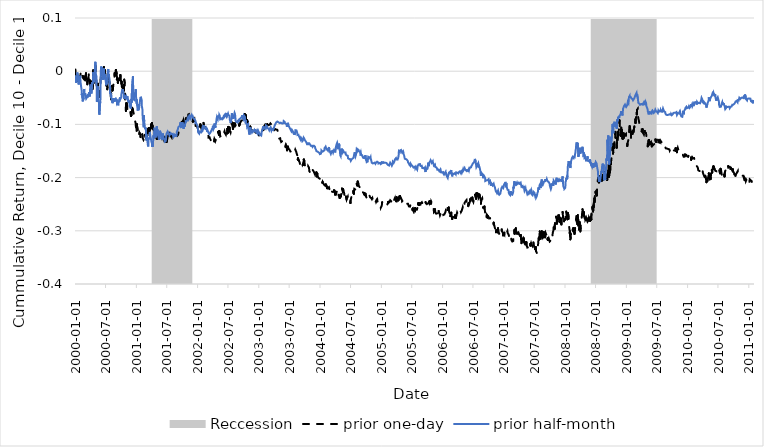
| Category | prior one-day | prior half-month |
|---|---|---|
| 2000-01-03 | 0.003 | -0.008 |
| 2000-01-04 | -0.003 | -0.012 |
| 2000-01-05 | -0.006 | -0.019 |
| 2000-01-06 | -0.02 | -0.017 |
| 2000-01-07 | -0.022 | -0.022 |
| 2000-01-10 | -0.019 | -0.021 |
| 2000-01-11 | -0.021 | -0.024 |
| 2000-01-12 | -0.018 | -0.015 |
| 2000-01-13 | -0.015 | -0.012 |
| 2000-01-14 | -0.017 | -0.002 |
| 2000-01-18 | -0.018 | -0.008 |
| 2000-01-19 | -0.016 | -0.01 |
| 2000-01-20 | -0.014 | -0.016 |
| 2000-01-21 | -0.011 | -0.025 |
| 2000-01-24 | -0.015 | -0.023 |
| 2000-01-25 | -0.012 | -0.019 |
| 2000-01-26 | -0.011 | -0.014 |
| 2000-01-27 | -0.01 | -0.015 |
| 2000-01-28 | -0.016 | -0.018 |
| 2000-01-31 | -0.011 | -0.009 |
| 2000-02-01 | -0.01 | -0.013 |
| 2000-02-02 | -0.008 | -0.018 |
| 2000-02-03 | -0.006 | -0.022 |
| 2000-02-04 | -0.001 | -0.024 |
| 2000-02-07 | -0.002 | -0.031 |
| 2000-02-08 | 0 | -0.033 |
| 2000-02-09 | -0.003 | -0.035 |
| 2000-02-10 | -0.002 | -0.045 |
| 2000-02-11 | -0.003 | -0.041 |
| 2000-02-14 | -0.006 | -0.051 |
| 2000-02-15 | -0.008 | -0.054 |
| 2000-02-16 | -0.012 | -0.057 |
| 2000-02-17 | -0.013 | -0.052 |
| 2000-02-18 | -0.014 | -0.054 |
| 2000-02-22 | -0.015 | -0.05 |
| 2000-02-23 | -0.01 | -0.038 |
| 2000-02-24 | -0.013 | -0.033 |
| 2000-02-25 | -0.014 | -0.039 |
| 2000-02-28 | -0.012 | -0.045 |
| 2000-02-29 | -0.015 | -0.044 |
| 2000-03-01 | -0.013 | -0.042 |
| 2000-03-02 | -0.016 | -0.043 |
| 2000-03-03 | -0.01 | -0.043 |
| 2000-03-06 | -0.004 | -0.05 |
| 2000-03-07 | -0.015 | -0.049 |
| 2000-03-08 | -0.015 | -0.048 |
| 2000-03-09 | -0.013 | -0.047 |
| 2000-03-10 | -0.014 | -0.049 |
| 2000-03-13 | -0.017 | -0.048 |
| 2000-03-14 | -0.025 | -0.047 |
| 2000-03-15 | -0.025 | -0.049 |
| 2000-03-16 | -0.026 | -0.044 |
| 2000-03-17 | -0.014 | -0.047 |
| 2000-03-20 | -0.017 | -0.048 |
| 2000-03-21 | -0.013 | -0.049 |
| 2000-03-22 | -0.008 | -0.049 |
| 2000-03-23 | -0.006 | -0.046 |
| 2000-03-24 | -0.004 | -0.039 |
| 2000-03-27 | -0.003 | -0.039 |
| 2000-03-28 | -0.006 | -0.042 |
| 2000-03-29 | -0.014 | -0.047 |
| 2000-03-30 | -0.026 | -0.035 |
| 2000-03-31 | -0.027 | -0.032 |
| 2000-04-03 | -0.021 | -0.025 |
| 2000-04-04 | -0.019 | -0.029 |
| 2000-04-05 | -0.02 | -0.038 |
| 2000-04-06 | -0.021 | -0.04 |
| 2000-04-07 | -0.027 | -0.042 |
| 2000-04-10 | -0.022 | -0.035 |
| 2000-04-11 | -0.022 | -0.027 |
| 2000-04-12 | -0.024 | -0.02 |
| 2000-04-13 | -0.026 | -0.024 |
| 2000-04-14 | -0.034 | -0.024 |
| 2000-04-17 | -0.018 | -0.02 |
| 2000-04-18 | 0.002 | -0.002 |
| 2000-04-19 | -0.003 | -0.006 |
| 2000-04-20 | -0.011 | -0.008 |
| 2000-04-24 | -0.021 | -0.021 |
| 2000-04-25 | -0.006 | -0.008 |
| 2000-04-26 | -0.011 | -0.008 |
| 2000-04-27 | -0.002 | -0.001 |
| 2000-04-28 | 0.005 | 0.004 |
| 2000-05-01 | 0.011 | 0.018 |
| 2000-05-02 | -0.003 | -0.008 |
| 2000-05-03 | -0.008 | -0.016 |
| 2000-05-04 | -0.012 | -0.011 |
| 2000-05-05 | -0.014 | -0.005 |
| 2000-05-08 | -0.023 | -0.022 |
| 2000-05-09 | -0.03 | -0.035 |
| 2000-05-10 | -0.042 | -0.058 |
| 2000-05-11 | -0.04 | -0.05 |
| 2000-05-12 | -0.034 | -0.043 |
| 2000-05-15 | -0.026 | -0.04 |
| 2000-05-16 | -0.023 | -0.029 |
| 2000-05-17 | -0.028 | -0.031 |
| 2000-05-18 | -0.029 | -0.04 |
| 2000-05-19 | -0.038 | -0.053 |
| 2000-05-22 | -0.042 | -0.059 |
| 2000-05-23 | -0.048 | -0.078 |
| 2000-05-24 | -0.046 | -0.078 |
| 2000-05-25 | -0.039 | -0.082 |
| 2000-05-26 | -0.041 | -0.081 |
| 2000-05-30 | -0.028 | -0.057 |
| 2000-05-31 | -0.023 | -0.053 |
| 2000-06-01 | -0.017 | -0.037 |
| 2000-06-02 | -0.008 | 0 |
| 2000-06-05 | -0.008 | 0.009 |
| 2000-06-06 | -0.008 | 0.001 |
| 2000-06-07 | -0.004 | 0.005 |
| 2000-06-08 | -0.003 | 0.003 |
| 2000-06-09 | -0.007 | 0.008 |
| 2000-06-12 | -0.005 | -0.008 |
| 2000-06-13 | -0.001 | -0.007 |
| 2000-06-14 | -0.002 | -0.016 |
| 2000-06-15 | -0.007 | -0.016 |
| 2000-06-16 | -0.012 | -0.016 |
| 2000-06-19 | 0.002 | 0.002 |
| 2000-06-20 | 0.005 | 0.005 |
| 2000-06-21 | 0.008 | 0.007 |
| 2000-06-22 | 0.002 | -0.001 |
| 2000-06-23 | -0.004 | -0.012 |
| 2000-06-26 | 0.002 | -0.009 |
| 2000-06-27 | -0.006 | -0.015 |
| 2000-06-28 | -0.003 | -0.006 |
| 2000-06-29 | -0.009 | -0.013 |
| 2000-06-30 | -0.007 | -0.012 |
| 2000-07-03 | -0.01 | -0.011 |
| 2000-07-05 | -0.027 | -0.026 |
| 2000-07-06 | -0.024 | -0.023 |
| 2000-07-07 | -0.017 | -0.012 |
| 2000-07-10 | -0.027 | -0.013 |
| 2000-07-11 | -0.034 | -0.023 |
| 2000-07-12 | -0.03 | -0.017 |
| 2000-07-13 | -0.021 | -0.008 |
| 2000-07-14 | -0.014 | 0.001 |
| 2000-07-17 | -0.011 | 0.004 |
| 2000-07-18 | -0.018 | -0.002 |
| 2000-07-19 | -0.02 | -0.007 |
| 2000-07-20 | -0.012 | -0.005 |
| 2000-07-21 | -0.016 | -0.008 |
| 2000-07-24 | -0.02 | -0.015 |
| 2000-07-25 | -0.019 | -0.015 |
| 2000-07-26 | -0.023 | -0.023 |
| 2000-07-27 | -0.028 | -0.033 |
| 2000-07-28 | -0.036 | -0.043 |
| 2000-07-31 | -0.039 | -0.041 |
| 2000-08-01 | -0.047 | -0.045 |
| 2000-08-02 | -0.053 | -0.049 |
| 2000-08-03 | -0.042 | -0.045 |
| 2000-08-04 | -0.038 | -0.049 |
| 2000-08-07 | -0.032 | -0.05 |
| 2000-08-08 | -0.027 | -0.05 |
| 2000-08-09 | -0.03 | -0.058 |
| 2000-08-10 | -0.034 | -0.059 |
| 2000-08-11 | -0.036 | -0.06 |
| 2000-08-14 | -0.032 | -0.056 |
| 2000-08-15 | -0.031 | -0.051 |
| 2000-08-16 | -0.032 | -0.053 |
| 2000-08-17 | -0.024 | -0.051 |
| 2000-08-18 | -0.021 | -0.053 |
| 2000-08-21 | -0.019 | -0.056 |
| 2000-08-22 | -0.016 | -0.056 |
| 2000-08-23 | -0.008 | -0.058 |
| 2000-08-24 | -0.004 | -0.056 |
| 2000-08-25 | -0.008 | -0.054 |
| 2000-08-28 | -0.005 | -0.053 |
| 2000-08-29 | -0.005 | -0.053 |
| 2000-08-30 | -0.006 | -0.052 |
| 2000-08-31 | 0.002 | -0.051 |
| 2000-09-01 | 0.004 | -0.052 |
| 2000-09-05 | -0.004 | -0.053 |
| 2000-09-06 | -0.016 | -0.055 |
| 2000-09-07 | -0.011 | -0.06 |
| 2000-09-08 | -0.015 | -0.06 |
| 2000-09-11 | -0.018 | -0.057 |
| 2000-09-12 | -0.022 | -0.059 |
| 2000-09-13 | -0.022 | -0.061 |
| 2000-09-14 | -0.02 | -0.064 |
| 2000-09-15 | -0.017 | -0.061 |
| 2000-09-18 | -0.017 | -0.058 |
| 2000-09-19 | -0.017 | -0.056 |
| 2000-09-20 | -0.014 | -0.058 |
| 2000-09-21 | -0.016 | -0.057 |
| 2000-09-22 | -0.016 | -0.053 |
| 2000-09-25 | -0.013 | -0.049 |
| 2000-09-26 | -0.01 | -0.053 |
| 2000-09-27 | -0.007 | -0.052 |
| 2000-09-28 | -0.013 | -0.051 |
| 2000-09-29 | -0.014 | -0.053 |
| 2000-10-02 | -0.02 | -0.049 |
| 2000-10-03 | -0.024 | -0.043 |
| 2000-10-04 | -0.02 | -0.043 |
| 2000-10-05 | -0.022 | -0.04 |
| 2000-10-06 | -0.029 | -0.04 |
| 2000-10-09 | -0.03 | -0.041 |
| 2000-10-10 | -0.035 | -0.035 |
| 2000-10-11 | -0.04 | -0.037 |
| 2000-10-12 | -0.04 | -0.033 |
| 2000-10-13 | -0.028 | -0.038 |
| 2000-10-16 | -0.026 | -0.041 |
| 2000-10-17 | -0.028 | -0.044 |
| 2000-10-18 | -0.037 | -0.048 |
| 2000-10-19 | -0.027 | -0.052 |
| 2000-10-20 | -0.016 | -0.045 |
| 2000-10-23 | -0.022 | -0.045 |
| 2000-10-24 | -0.031 | -0.046 |
| 2000-10-25 | -0.052 | -0.048 |
| 2000-10-26 | -0.054 | -0.048 |
| 2000-10-27 | -0.06 | -0.049 |
| 2000-10-30 | -0.075 | -0.053 |
| 2000-10-31 | -0.065 | -0.05 |
| 2000-11-01 | -0.061 | -0.049 |
| 2000-11-02 | -0.063 | -0.048 |
| 2000-11-03 | -0.06 | -0.049 |
| 2000-11-06 | -0.063 | -0.051 |
| 2000-11-07 | -0.065 | -0.051 |
| 2000-11-08 | -0.072 | -0.047 |
| 2000-11-09 | -0.071 | -0.049 |
| 2000-11-10 | -0.075 | -0.051 |
| 2000-11-13 | -0.075 | -0.054 |
| 2000-11-14 | -0.072 | -0.057 |
| 2000-11-15 | -0.072 | -0.054 |
| 2000-11-16 | -0.072 | -0.058 |
| 2000-11-17 | -0.073 | -0.056 |
| 2000-11-20 | -0.071 | -0.06 |
| 2000-11-21 | -0.071 | -0.062 |
| 2000-11-22 | -0.071 | -0.066 |
| 2000-11-24 | -0.073 | -0.061 |
| 2000-11-27 | -0.08 | -0.061 |
| 2000-11-28 | -0.082 | -0.07 |
| 2000-11-29 | -0.084 | -0.066 |
| 2000-11-30 | -0.081 | -0.062 |
| 2000-12-01 | -0.084 | -0.052 |
| 2000-12-04 | -0.077 | -0.059 |
| 2000-12-05 | -0.076 | -0.034 |
| 2000-12-06 | -0.071 | -0.035 |
| 2000-12-07 | -0.069 | -0.036 |
| 2000-12-08 | -0.068 | -0.018 |
| 2000-12-11 | -0.072 | -0.01 |
| 2000-12-12 | -0.071 | -0.024 |
| 2000-12-13 | -0.076 | -0.043 |
| 2000-12-14 | -0.077 | -0.053 |
| 2000-12-15 | -0.079 | -0.054 |
| 2000-12-18 | -0.087 | -0.054 |
| 2000-12-19 | -0.09 | -0.051 |
| 2000-12-20 | -0.09 | -0.054 |
| 2000-12-21 | -0.089 | -0.054 |
| 2000-12-22 | -0.091 | -0.042 |
| 2000-12-26 | -0.096 | -0.043 |
| 2000-12-27 | -0.098 | -0.039 |
| 2000-12-28 | -0.103 | -0.034 |
| 2000-12-29 | -0.104 | -0.046 |
| 2001-01-02 | -0.112 | -0.061 |
| 2001-01-03 | -0.104 | -0.053 |
| 2001-01-04 | -0.099 | -0.06 |
| 2001-01-05 | -0.103 | -0.065 |
| 2001-01-08 | -0.104 | -0.067 |
| 2001-01-09 | -0.109 | -0.074 |
| 2001-01-10 | -0.113 | -0.07 |
| 2001-01-11 | -0.111 | -0.065 |
| 2001-01-12 | -0.116 | -0.066 |
| 2001-01-16 | -0.114 | -0.064 |
| 2001-01-17 | -0.115 | -0.069 |
| 2001-01-18 | -0.118 | -0.066 |
| 2001-01-19 | -0.116 | -0.064 |
| 2001-01-22 | -0.117 | -0.056 |
| 2001-01-23 | -0.118 | -0.053 |
| 2001-01-24 | -0.124 | -0.054 |
| 2001-01-25 | -0.122 | -0.051 |
| 2001-01-26 | -0.123 | -0.048 |
| 2001-01-29 | -0.126 | -0.05 |
| 2001-01-30 | -0.126 | -0.051 |
| 2001-01-31 | -0.127 | -0.05 |
| 2001-02-01 | -0.124 | -0.054 |
| 2001-02-02 | -0.121 | -0.065 |
| 2001-02-05 | -0.119 | -0.071 |
| 2001-02-06 | -0.124 | -0.074 |
| 2001-02-07 | -0.125 | -0.086 |
| 2001-02-08 | -0.126 | -0.09 |
| 2001-02-09 | -0.125 | -0.092 |
| 2001-02-12 | -0.129 | -0.097 |
| 2001-02-13 | -0.129 | -0.106 |
| 2001-02-14 | -0.129 | -0.091 |
| 2001-02-15 | -0.131 | -0.083 |
| 2001-02-16 | -0.126 | -0.094 |
| 2001-02-20 | -0.123 | -0.104 |
| 2001-02-21 | -0.12 | -0.105 |
| 2001-02-22 | -0.119 | -0.109 |
| 2001-02-23 | -0.121 | -0.106 |
| 2001-02-26 | -0.125 | -0.109 |
| 2001-02-27 | -0.119 | -0.121 |
| 2001-02-28 | -0.116 | -0.125 |
| 2001-03-01 | -0.118 | -0.118 |
| 2001-03-02 | -0.114 | -0.13 |
| 2001-03-05 | -0.115 | -0.129 |
| 2001-03-06 | -0.121 | -0.124 |
| 2001-03-07 | -0.12 | -0.125 |
| 2001-03-08 | -0.117 | -0.131 |
| 2001-03-09 | -0.11 | -0.138 |
| 2001-03-12 | -0.108 | -0.141 |
| 2001-03-13 | -0.115 | -0.129 |
| 2001-03-14 | -0.111 | -0.127 |
| 2001-03-15 | -0.11 | -0.127 |
| 2001-03-16 | -0.107 | -0.128 |
| 2001-03-19 | -0.109 | -0.126 |
| 2001-03-20 | -0.109 | -0.127 |
| 2001-03-21 | -0.11 | -0.123 |
| 2001-03-22 | -0.112 | -0.114 |
| 2001-03-23 | -0.11 | -0.117 |
| 2001-03-26 | -0.109 | -0.124 |
| 2001-03-27 | -0.109 | -0.126 |
| 2001-03-28 | -0.104 | -0.125 |
| 2001-03-29 | -0.1 | -0.128 |
| 2001-03-30 | -0.105 | -0.131 |
| 2001-04-02 | -0.103 | -0.133 |
| 2001-04-03 | -0.097 | -0.136 |
| 2001-04-04 | -0.1 | -0.142 |
| 2001-04-05 | -0.107 | -0.134 |
| 2001-04-06 | -0.102 | -0.137 |
| 2001-04-09 | -0.103 | -0.142 |
| 2001-04-10 | -0.108 | -0.135 |
| 2001-04-11 | -0.11 | -0.125 |
| 2001-04-12 | -0.11 | -0.121 |
| 2001-04-16 | -0.11 | -0.126 |
| 2001-04-17 | -0.112 | -0.127 |
| 2001-04-18 | -0.112 | -0.112 |
| 2001-04-19 | -0.113 | -0.106 |
| 2001-04-20 | -0.114 | -0.108 |
| 2001-04-23 | -0.116 | -0.117 |
| 2001-04-24 | -0.115 | -0.121 |
| 2001-04-25 | -0.116 | -0.124 |
| 2001-04-26 | -0.117 | -0.126 |
| 2001-04-27 | -0.118 | -0.123 |
| 2001-04-30 | -0.122 | -0.124 |
| 2001-05-01 | -0.125 | -0.12 |
| 2001-05-02 | -0.127 | -0.104 |
| 2001-05-03 | -0.121 | -0.109 |
| 2001-05-04 | -0.127 | -0.112 |
| 2001-05-07 | -0.124 | -0.112 |
| 2001-05-08 | -0.125 | -0.11 |
| 2001-05-09 | -0.124 | -0.119 |
| 2001-05-10 | -0.121 | -0.119 |
| 2001-05-11 | -0.12 | -0.118 |
| 2001-05-14 | -0.119 | -0.126 |
| 2001-05-15 | -0.12 | -0.129 |
| 2001-05-16 | -0.124 | -0.122 |
| 2001-05-17 | -0.124 | -0.118 |
| 2001-05-18 | -0.126 | -0.123 |
| 2001-05-21 | -0.128 | -0.112 |
| 2001-05-22 | -0.126 | -0.111 |
| 2001-05-23 | -0.126 | -0.113 |
| 2001-05-24 | -0.125 | -0.112 |
| 2001-05-25 | -0.122 | -0.113 |
| 2001-05-29 | -0.122 | -0.12 |
| 2001-05-30 | -0.122 | -0.128 |
| 2001-05-31 | -0.123 | -0.127 |
| 2001-06-01 | -0.125 | -0.124 |
| 2001-06-04 | -0.127 | -0.129 |
| 2001-06-05 | -0.129 | -0.127 |
| 2001-06-06 | -0.127 | -0.122 |
| 2001-06-07 | -0.125 | -0.117 |
| 2001-06-08 | -0.126 | -0.12 |
| 2001-06-11 | -0.124 | -0.123 |
| 2001-06-12 | -0.125 | -0.126 |
| 2001-06-13 | -0.127 | -0.124 |
| 2001-06-14 | -0.126 | -0.126 |
| 2001-06-15 | -0.126 | -0.127 |
| 2001-06-18 | -0.122 | -0.13 |
| 2001-06-19 | -0.12 | -0.132 |
| 2001-06-20 | -0.122 | -0.132 |
| 2001-06-21 | -0.119 | -0.134 |
| 2001-06-22 | -0.117 | -0.134 |
| 2001-06-25 | -0.118 | -0.131 |
| 2001-06-26 | -0.121 | -0.13 |
| 2001-06-27 | -0.124 | -0.124 |
| 2001-06-28 | -0.126 | -0.122 |
| 2001-06-29 | -0.133 | -0.118 |
| 2001-07-02 | -0.13 | -0.116 |
| 2001-07-03 | -0.13 | -0.115 |
| 2001-07-05 | -0.126 | -0.115 |
| 2001-07-06 | -0.119 | -0.113 |
| 2001-07-09 | -0.12 | -0.115 |
| 2001-07-10 | -0.117 | -0.114 |
| 2001-07-11 | -0.117 | -0.116 |
| 2001-07-12 | -0.121 | -0.118 |
| 2001-07-13 | -0.12 | -0.118 |
| 2001-07-16 | -0.116 | -0.118 |
| 2001-07-17 | -0.119 | -0.121 |
| 2001-07-18 | -0.117 | -0.121 |
| 2001-07-19 | -0.119 | -0.121 |
| 2001-07-20 | -0.122 | -0.119 |
| 2001-07-23 | -0.121 | -0.117 |
| 2001-07-24 | -0.118 | -0.116 |
| 2001-07-25 | -0.118 | -0.116 |
| 2001-07-26 | -0.122 | -0.117 |
| 2001-07-27 | -0.124 | -0.117 |
| 2001-07-30 | -0.124 | -0.118 |
| 2001-07-31 | -0.122 | -0.12 |
| 2001-08-01 | -0.122 | -0.119 |
| 2001-08-02 | -0.119 | -0.119 |
| 2001-08-03 | -0.12 | -0.118 |
| 2001-08-06 | -0.118 | -0.118 |
| 2001-08-07 | -0.117 | -0.121 |
| 2001-08-08 | -0.114 | -0.121 |
| 2001-08-09 | -0.113 | -0.122 |
| 2001-08-10 | -0.113 | -0.124 |
| 2001-08-13 | -0.115 | -0.123 |
| 2001-08-14 | -0.117 | -0.122 |
| 2001-08-15 | -0.117 | -0.121 |
| 2001-08-16 | -0.118 | -0.121 |
| 2001-08-17 | -0.117 | -0.119 |
| 2001-08-20 | -0.116 | -0.119 |
| 2001-08-21 | -0.116 | -0.12 |
| 2001-08-22 | -0.117 | -0.12 |
| 2001-08-23 | -0.118 | -0.12 |
| 2001-08-24 | -0.121 | -0.124 |
| 2001-08-27 | -0.123 | -0.123 |
| 2001-08-28 | -0.122 | -0.12 |
| 2001-08-29 | -0.123 | -0.117 |
| 2001-08-30 | -0.122 | -0.114 |
| 2001-08-31 | -0.121 | -0.113 |
| 2001-09-04 | -0.121 | -0.11 |
| 2001-09-05 | -0.12 | -0.111 |
| 2001-09-06 | -0.121 | -0.108 |
| 2001-09-07 | -0.119 | -0.106 |
| 2001-09-10 | -0.115 | -0.107 |
| 2001-09-17 | -0.109 | -0.102 |
| 2001-09-18 | -0.109 | -0.1 |
| 2001-09-19 | -0.107 | -0.101 |
| 2001-09-20 | -0.102 | -0.099 |
| 2001-09-21 | -0.1 | -0.096 |
| 2001-09-24 | -0.103 | -0.105 |
| 2001-09-25 | -0.102 | -0.106 |
| 2001-09-26 | -0.097 | -0.104 |
| 2001-09-27 | -0.096 | -0.105 |
| 2001-09-28 | -0.1 | -0.104 |
| 2001-10-01 | -0.095 | -0.104 |
| 2001-10-02 | -0.096 | -0.104 |
| 2001-10-03 | -0.096 | -0.096 |
| 2001-10-04 | -0.098 | -0.103 |
| 2001-10-05 | -0.094 | -0.102 |
| 2001-10-08 | -0.092 | -0.102 |
| 2001-10-09 | -0.094 | -0.108 |
| 2001-10-10 | -0.095 | -0.109 |
| 2001-10-11 | -0.098 | -0.104 |
| 2001-10-12 | -0.096 | -0.104 |
| 2001-10-15 | -0.096 | -0.1 |
| 2001-10-16 | -0.097 | -0.1 |
| 2001-10-17 | -0.097 | -0.104 |
| 2001-10-18 | -0.095 | -0.1 |
| 2001-10-19 | -0.095 | -0.098 |
| 2001-10-22 | -0.092 | -0.094 |
| 2001-10-23 | -0.089 | -0.092 |
| 2001-10-24 | -0.092 | -0.092 |
| 2001-10-25 | -0.092 | -0.093 |
| 2001-10-26 | -0.093 | -0.094 |
| 2001-10-29 | -0.09 | -0.096 |
| 2001-10-30 | -0.089 | -0.094 |
| 2001-10-31 | -0.089 | -0.092 |
| 2001-11-01 | -0.088 | -0.092 |
| 2001-11-02 | -0.086 | -0.089 |
| 2001-11-05 | -0.086 | -0.086 |
| 2001-11-06 | -0.085 | -0.085 |
| 2001-11-07 | -0.081 | -0.086 |
| 2001-11-08 | -0.086 | -0.091 |
| 2001-11-09 | -0.085 | -0.092 |
| 2001-11-12 | -0.083 | -0.09 |
| 2001-11-13 | -0.082 | -0.09 |
| 2001-11-14 | -0.084 | -0.088 |
| 2001-11-15 | -0.088 | -0.085 |
| 2001-11-16 | -0.092 | -0.087 |
| 2001-11-19 | -0.091 | -0.084 |
| 2001-11-20 | -0.092 | -0.088 |
| 2001-11-21 | -0.092 | -0.086 |
| 2001-11-23 | -0.091 | -0.087 |
| 2001-11-26 | -0.09 | -0.083 |
| 2001-11-27 | -0.091 | -0.083 |
| 2001-11-28 | -0.094 | -0.085 |
| 2001-11-29 | -0.092 | -0.082 |
| 2001-11-30 | -0.092 | -0.083 |
| 2001-12-03 | -0.095 | -0.087 |
| 2001-12-04 | -0.093 | -0.087 |
| 2001-12-05 | -0.088 | -0.085 |
| 2001-12-06 | -0.09 | -0.086 |
| 2001-12-07 | -0.093 | -0.089 |
| 2001-12-10 | -0.093 | -0.091 |
| 2001-12-11 | -0.091 | -0.088 |
| 2001-12-12 | -0.09 | -0.087 |
| 2001-12-13 | -0.094 | -0.09 |
| 2001-12-14 | -0.097 | -0.091 |
| 2001-12-17 | -0.096 | -0.089 |
| 2001-12-18 | -0.096 | -0.089 |
| 2001-12-19 | -0.098 | -0.093 |
| 2001-12-20 | -0.103 | -0.099 |
| 2001-12-21 | -0.1 | -0.097 |
| 2001-12-24 | -0.101 | -0.097 |
| 2001-12-26 | -0.101 | -0.098 |
| 2001-12-27 | -0.103 | -0.1 |
| 2001-12-28 | -0.103 | -0.1 |
| 2001-12-31 | -0.106 | -0.103 |
| 2002-01-02 | -0.105 | -0.106 |
| 2002-01-03 | -0.102 | -0.113 |
| 2002-01-04 | -0.102 | -0.115 |
| 2002-01-07 | -0.102 | -0.114 |
| 2002-01-08 | -0.102 | -0.115 |
| 2002-01-09 | -0.1 | -0.116 |
| 2002-01-10 | -0.101 | -0.117 |
| 2002-01-11 | -0.102 | -0.115 |
| 2002-01-14 | -0.101 | -0.112 |
| 2002-01-15 | -0.101 | -0.115 |
| 2002-01-16 | -0.104 | -0.114 |
| 2002-01-17 | -0.1 | -0.115 |
| 2002-01-18 | -0.103 | -0.115 |
| 2002-01-22 | -0.107 | -0.115 |
| 2002-01-23 | -0.106 | -0.115 |
| 2002-01-24 | -0.104 | -0.115 |
| 2002-01-25 | -0.106 | -0.112 |
| 2002-01-28 | -0.104 | -0.112 |
| 2002-01-29 | -0.101 | -0.107 |
| 2002-01-30 | -0.101 | -0.108 |
| 2002-01-31 | -0.101 | -0.108 |
| 2002-02-01 | -0.102 | -0.11 |
| 2002-02-04 | -0.102 | -0.107 |
| 2002-02-05 | -0.097 | -0.103 |
| 2002-02-06 | -0.097 | -0.101 |
| 2002-02-07 | -0.102 | -0.106 |
| 2002-02-08 | -0.102 | -0.108 |
| 2002-02-11 | -0.104 | -0.108 |
| 2002-02-12 | -0.104 | -0.108 |
| 2002-02-13 | -0.104 | -0.108 |
| 2002-02-14 | -0.104 | -0.107 |
| 2002-02-15 | -0.105 | -0.106 |
| 2002-02-19 | -0.108 | -0.106 |
| 2002-02-20 | -0.109 | -0.11 |
| 2002-02-21 | -0.11 | -0.107 |
| 2002-02-22 | -0.112 | -0.108 |
| 2002-02-25 | -0.113 | -0.111 |
| 2002-02-26 | -0.115 | -0.112 |
| 2002-02-27 | -0.116 | -0.114 |
| 2002-02-28 | -0.116 | -0.113 |
| 2002-03-01 | -0.115 | -0.111 |
| 2002-03-04 | -0.118 | -0.11 |
| 2002-03-05 | -0.119 | -0.11 |
| 2002-03-06 | -0.122 | -0.115 |
| 2002-03-07 | -0.125 | -0.117 |
| 2002-03-08 | -0.124 | -0.115 |
| 2002-03-11 | -0.124 | -0.116 |
| 2002-03-12 | -0.125 | -0.118 |
| 2002-03-13 | -0.124 | -0.116 |
| 2002-03-14 | -0.126 | -0.117 |
| 2002-03-15 | -0.126 | -0.117 |
| 2002-03-18 | -0.127 | -0.115 |
| 2002-03-19 | -0.128 | -0.114 |
| 2002-03-20 | -0.13 | -0.114 |
| 2002-03-21 | -0.129 | -0.114 |
| 2002-03-22 | -0.127 | -0.113 |
| 2002-03-25 | -0.127 | -0.111 |
| 2002-03-26 | -0.129 | -0.112 |
| 2002-03-27 | -0.13 | -0.108 |
| 2002-03-28 | -0.13 | -0.11 |
| 2002-04-01 | -0.128 | -0.107 |
| 2002-04-02 | -0.129 | -0.103 |
| 2002-04-03 | -0.128 | -0.105 |
| 2002-04-04 | -0.128 | -0.107 |
| 2002-04-05 | -0.129 | -0.109 |
| 2002-04-08 | -0.13 | -0.108 |
| 2002-04-09 | -0.132 | -0.109 |
| 2002-04-10 | -0.132 | -0.106 |
| 2002-04-11 | -0.128 | -0.099 |
| 2002-04-12 | -0.129 | -0.106 |
| 2002-04-15 | -0.128 | -0.103 |
| 2002-04-16 | -0.132 | -0.106 |
| 2002-04-17 | -0.132 | -0.103 |
| 2002-04-18 | -0.13 | -0.1 |
| 2002-04-19 | -0.129 | -0.099 |
| 2002-04-22 | -0.126 | -0.096 |
| 2002-04-23 | -0.125 | -0.091 |
| 2002-04-24 | -0.123 | -0.091 |
| 2002-04-25 | -0.123 | -0.092 |
| 2002-04-26 | -0.121 | -0.086 |
| 2002-04-29 | -0.121 | -0.086 |
| 2002-04-30 | -0.123 | -0.088 |
| 2002-05-01 | -0.121 | -0.09 |
| 2002-05-02 | -0.117 | -0.087 |
| 2002-05-03 | -0.114 | -0.083 |
| 2002-05-06 | -0.112 | -0.084 |
| 2002-05-07 | -0.112 | -0.083 |
| 2002-05-08 | -0.119 | -0.088 |
| 2002-05-09 | -0.116 | -0.086 |
| 2002-05-10 | -0.112 | -0.082 |
| 2002-05-13 | -0.113 | -0.084 |
| 2002-05-14 | -0.119 | -0.088 |
| 2002-05-15 | -0.123 | -0.09 |
| 2002-05-16 | -0.122 | -0.09 |
| 2002-05-17 | -0.122 | -0.092 |
| 2002-05-20 | -0.122 | -0.091 |
| 2002-05-21 | -0.122 | -0.089 |
| 2002-05-22 | -0.123 | -0.089 |
| 2002-05-23 | -0.124 | -0.088 |
| 2002-05-24 | -0.124 | -0.089 |
| 2002-05-28 | -0.124 | -0.088 |
| 2002-05-29 | -0.122 | -0.09 |
| 2002-05-30 | -0.122 | -0.09 |
| 2002-05-31 | -0.121 | -0.09 |
| 2002-06-03 | -0.119 | -0.089 |
| 2002-06-04 | -0.12 | -0.088 |
| 2002-06-05 | -0.118 | -0.084 |
| 2002-06-06 | -0.116 | -0.085 |
| 2002-06-07 | -0.115 | -0.086 |
| 2002-06-10 | -0.113 | -0.084 |
| 2002-06-11 | -0.114 | -0.082 |
| 2002-06-12 | -0.116 | -0.084 |
| 2002-06-13 | -0.117 | -0.085 |
| 2002-06-14 | -0.117 | -0.086 |
| 2002-06-17 | -0.118 | -0.081 |
| 2002-06-18 | -0.119 | -0.083 |
| 2002-06-19 | -0.117 | -0.081 |
| 2002-06-20 | -0.114 | -0.082 |
| 2002-06-21 | -0.113 | -0.085 |
| 2002-06-24 | -0.112 | -0.081 |
| 2002-06-25 | -0.11 | -0.083 |
| 2002-06-26 | -0.108 | -0.079 |
| 2002-06-27 | -0.11 | -0.078 |
| 2002-06-28 | -0.117 | -0.082 |
| 2002-07-01 | -0.109 | -0.08 |
| 2002-07-02 | -0.105 | -0.078 |
| 2002-07-03 | -0.108 | -0.082 |
| 2002-07-05 | -0.113 | -0.082 |
| 2002-07-08 | -0.111 | -0.083 |
| 2002-07-09 | -0.108 | -0.084 |
| 2002-07-10 | -0.106 | -0.082 |
| 2002-07-11 | -0.109 | -0.089 |
| 2002-07-12 | -0.112 | -0.092 |
| 2002-07-15 | -0.113 | -0.095 |
| 2002-07-16 | -0.115 | -0.096 |
| 2002-07-17 | -0.114 | -0.097 |
| 2002-07-18 | -0.113 | -0.097 |
| 2002-07-19 | -0.11 | -0.093 |
| 2002-07-22 | -0.105 | -0.09 |
| 2002-07-23 | -0.096 | -0.083 |
| 2002-07-24 | -0.098 | -0.079 |
| 2002-07-25 | -0.098 | -0.083 |
| 2002-07-26 | -0.098 | -0.083 |
| 2002-07-29 | -0.106 | -0.082 |
| 2002-07-30 | -0.109 | -0.088 |
| 2002-07-31 | -0.103 | -0.09 |
| 2002-08-01 | -0.104 | -0.082 |
| 2002-08-02 | -0.101 | -0.089 |
| 2002-08-05 | -0.098 | -0.084 |
| 2002-08-06 | -0.101 | -0.083 |
| 2002-08-07 | -0.102 | -0.081 |
| 2002-08-08 | -0.103 | -0.081 |
| 2002-08-09 | -0.102 | -0.078 |
| 2002-08-12 | -0.102 | -0.081 |
| 2002-08-13 | -0.1 | -0.08 |
| 2002-08-14 | -0.1 | -0.088 |
| 2002-08-15 | -0.102 | -0.093 |
| 2002-08-16 | -0.1 | -0.094 |
| 2002-08-19 | -0.101 | -0.093 |
| 2002-08-20 | -0.099 | -0.093 |
| 2002-08-21 | -0.102 | -0.096 |
| 2002-08-22 | -0.103 | -0.096 |
| 2002-08-23 | -0.102 | -0.095 |
| 2002-08-26 | -0.103 | -0.097 |
| 2002-08-27 | -0.103 | -0.096 |
| 2002-08-28 | -0.102 | -0.096 |
| 2002-08-29 | -0.101 | -0.093 |
| 2002-08-30 | -0.101 | -0.094 |
| 2002-09-03 | -0.099 | -0.091 |
| 2002-09-04 | -0.102 | -0.093 |
| 2002-09-05 | -0.099 | -0.089 |
| 2002-09-06 | -0.102 | -0.091 |
| 2002-09-09 | -0.1 | -0.091 |
| 2002-09-10 | -0.099 | -0.093 |
| 2002-09-11 | -0.099 | -0.092 |
| 2002-09-12 | -0.097 | -0.089 |
| 2002-09-13 | -0.097 | -0.089 |
| 2002-09-16 | -0.095 | -0.088 |
| 2002-09-17 | -0.094 | -0.087 |
| 2002-09-18 | -0.094 | -0.087 |
| 2002-09-19 | -0.094 | -0.087 |
| 2002-09-20 | -0.095 | -0.086 |
| 2002-09-23 | -0.092 | -0.084 |
| 2002-09-24 | -0.09 | -0.083 |
| 2002-09-25 | -0.095 | -0.087 |
| 2002-09-26 | -0.097 | -0.087 |
| 2002-09-27 | -0.096 | -0.087 |
| 2002-09-30 | -0.096 | -0.086 |
| 2002-10-01 | -0.097 | -0.091 |
| 2002-10-02 | -0.094 | -0.089 |
| 2002-10-03 | -0.096 | -0.085 |
| 2002-10-04 | -0.092 | -0.083 |
| 2002-10-07 | -0.089 | -0.082 |
| 2002-10-08 | -0.087 | -0.083 |
| 2002-10-09 | -0.081 | -0.082 |
| 2002-10-10 | -0.088 | -0.086 |
| 2002-10-11 | -0.09 | -0.091 |
| 2002-10-14 | -0.089 | -0.095 |
| 2002-10-15 | -0.09 | -0.098 |
| 2002-10-16 | -0.083 | -0.092 |
| 2002-10-17 | -0.09 | -0.098 |
| 2002-10-18 | -0.09 | -0.098 |
| 2002-10-21 | -0.095 | -0.101 |
| 2002-10-22 | -0.092 | -0.099 |
| 2002-10-23 | -0.097 | -0.104 |
| 2002-10-24 | -0.098 | -0.104 |
| 2002-10-25 | -0.1 | -0.102 |
| 2002-10-28 | -0.102 | -0.105 |
| 2002-10-29 | -0.098 | -0.101 |
| 2002-10-30 | -0.103 | -0.107 |
| 2002-10-31 | -0.104 | -0.107 |
| 2002-11-01 | -0.106 | -0.11 |
| 2002-11-04 | -0.111 | -0.117 |
| 2002-11-05 | -0.111 | -0.114 |
| 2002-11-06 | -0.114 | -0.119 |
| 2002-11-07 | -0.11 | -0.118 |
| 2002-11-08 | -0.108 | -0.111 |
| 2002-11-11 | -0.104 | -0.105 |
| 2002-11-12 | -0.107 | -0.109 |
| 2002-11-13 | -0.107 | -0.109 |
| 2002-11-14 | -0.11 | -0.11 |
| 2002-11-15 | -0.111 | -0.112 |
| 2002-11-18 | -0.11 | -0.114 |
| 2002-11-19 | -0.109 | -0.111 |
| 2002-11-20 | -0.111 | -0.113 |
| 2002-11-21 | -0.115 | -0.113 |
| 2002-11-22 | -0.117 | -0.113 |
| 2002-11-25 | -0.119 | -0.112 |
| 2002-11-26 | -0.118 | -0.111 |
| 2002-11-27 | -0.121 | -0.114 |
| 2002-11-29 | -0.122 | -0.115 |
| 2002-12-02 | -0.122 | -0.115 |
| 2002-12-03 | -0.118 | -0.111 |
| 2002-12-04 | -0.118 | -0.115 |
| 2002-12-05 | -0.117 | -0.113 |
| 2002-12-06 | -0.117 | -0.113 |
| 2002-12-09 | -0.115 | -0.109 |
| 2002-12-10 | -0.116 | -0.111 |
| 2002-12-11 | -0.116 | -0.112 |
| 2002-12-12 | -0.115 | -0.113 |
| 2002-12-13 | -0.113 | -0.11 |
| 2002-12-16 | -0.116 | -0.114 |
| 2002-12-17 | -0.116 | -0.115 |
| 2002-12-18 | -0.116 | -0.113 |
| 2002-12-19 | -0.115 | -0.112 |
| 2002-12-20 | -0.116 | -0.113 |
| 2002-12-23 | -0.115 | -0.116 |
| 2002-12-24 | -0.116 | -0.115 |
| 2002-12-26 | -0.117 | -0.114 |
| 2002-12-27 | -0.116 | -0.111 |
| 2002-12-30 | -0.117 | -0.111 |
| 2002-12-31 | -0.118 | -0.11 |
| 2003-01-02 | -0.121 | -0.116 |
| 2003-01-03 | -0.121 | -0.116 |
| 2003-01-06 | -0.122 | -0.121 |
| 2003-01-07 | -0.121 | -0.12 |
| 2003-01-08 | -0.12 | -0.117 |
| 2003-01-09 | -0.121 | -0.12 |
| 2003-01-10 | -0.121 | -0.12 |
| 2003-01-13 | -0.121 | -0.119 |
| 2003-01-14 | -0.121 | -0.121 |
| 2003-01-15 | -0.119 | -0.121 |
| 2003-01-16 | -0.119 | -0.119 |
| 2003-01-17 | -0.116 | -0.115 |
| 2003-01-21 | -0.115 | -0.111 |
| 2003-01-22 | -0.113 | -0.11 |
| 2003-01-23 | -0.114 | -0.113 |
| 2003-01-24 | -0.109 | -0.107 |
| 2003-01-27 | -0.107 | -0.104 |
| 2003-01-28 | -0.11 | -0.106 |
| 2003-01-29 | -0.111 | -0.11 |
| 2003-01-30 | -0.108 | -0.106 |
| 2003-01-31 | -0.109 | -0.106 |
| 2003-02-03 | -0.108 | -0.105 |
| 2003-02-04 | -0.104 | -0.106 |
| 2003-02-05 | -0.103 | -0.106 |
| 2003-02-06 | -0.103 | -0.105 |
| 2003-02-07 | -0.101 | -0.105 |
| 2003-02-10 | -0.102 | -0.108 |
| 2003-02-11 | -0.099 | -0.105 |
| 2003-02-12 | -0.097 | -0.102 |
| 2003-02-13 | -0.098 | -0.103 |
| 2003-02-14 | -0.1 | -0.102 |
| 2003-02-18 | -0.102 | -0.103 |
| 2003-02-19 | -0.1 | -0.104 |
| 2003-02-20 | -0.099 | -0.104 |
| 2003-02-21 | -0.102 | -0.107 |
| 2003-02-24 | -0.1 | -0.108 |
| 2003-02-25 | -0.101 | -0.108 |
| 2003-02-26 | -0.101 | -0.108 |
| 2003-02-27 | -0.101 | -0.108 |
| 2003-02-28 | -0.101 | -0.109 |
| 2003-03-03 | -0.102 | -0.109 |
| 2003-03-04 | -0.1 | -0.111 |
| 2003-03-05 | -0.101 | -0.111 |
| 2003-03-06 | -0.1 | -0.112 |
| 2003-03-07 | -0.102 | -0.109 |
| 2003-03-10 | -0.1 | -0.108 |
| 2003-03-11 | -0.098 | -0.108 |
| 2003-03-12 | -0.097 | -0.106 |
| 2003-03-13 | -0.099 | -0.107 |
| 2003-03-14 | -0.098 | -0.108 |
| 2003-03-17 | -0.1 | -0.112 |
| 2003-03-18 | -0.102 | -0.113 |
| 2003-03-19 | -0.104 | -0.11 |
| 2003-03-20 | -0.105 | -0.111 |
| 2003-03-21 | -0.108 | -0.109 |
| 2003-03-24 | -0.106 | -0.107 |
| 2003-03-25 | -0.108 | -0.109 |
| 2003-03-26 | -0.106 | -0.109 |
| 2003-03-27 | -0.108 | -0.11 |
| 2003-03-28 | -0.109 | -0.11 |
| 2003-03-31 | -0.108 | -0.107 |
| 2003-04-01 | -0.109 | -0.109 |
| 2003-04-02 | -0.111 | -0.105 |
| 2003-04-03 | -0.11 | -0.105 |
| 2003-04-04 | -0.11 | -0.103 |
| 2003-04-07 | -0.109 | -0.101 |
| 2003-04-08 | -0.109 | -0.1 |
| 2003-04-09 | -0.109 | -0.1 |
| 2003-04-10 | -0.109 | -0.099 |
| 2003-04-11 | -0.109 | -0.099 |
| 2003-04-14 | -0.11 | -0.099 |
| 2003-04-15 | -0.109 | -0.096 |
| 2003-04-16 | -0.109 | -0.095 |
| 2003-04-17 | -0.11 | -0.095 |
| 2003-04-21 | -0.11 | -0.095 |
| 2003-04-22 | -0.111 | -0.095 |
| 2003-04-23 | -0.113 | -0.096 |
| 2003-04-24 | -0.115 | -0.095 |
| 2003-04-25 | -0.116 | -0.096 |
| 2003-04-28 | -0.117 | -0.096 |
| 2003-04-29 | -0.119 | -0.096 |
| 2003-04-30 | -0.122 | -0.096 |
| 2003-05-01 | -0.123 | -0.097 |
| 2003-05-02 | -0.127 | -0.097 |
| 2003-05-05 | -0.127 | -0.098 |
| 2003-05-06 | -0.128 | -0.098 |
| 2003-05-07 | -0.126 | -0.096 |
| 2003-05-08 | -0.126 | -0.097 |
| 2003-05-09 | -0.129 | -0.097 |
| 2003-05-12 | -0.131 | -0.097 |
| 2003-05-13 | -0.132 | -0.095 |
| 2003-05-14 | -0.133 | -0.097 |
| 2003-05-15 | -0.134 | -0.096 |
| 2003-05-16 | -0.134 | -0.096 |
| 2003-05-19 | -0.131 | -0.098 |
| 2003-05-20 | -0.131 | -0.099 |
| 2003-05-21 | -0.13 | -0.099 |
| 2003-05-22 | -0.132 | -0.098 |
| 2003-05-23 | -0.132 | -0.099 |
| 2003-05-27 | -0.135 | -0.098 |
| 2003-05-28 | -0.136 | -0.096 |
| 2003-05-29 | -0.136 | -0.094 |
| 2003-05-30 | -0.139 | -0.096 |
| 2003-06-02 | -0.137 | -0.095 |
| 2003-06-03 | -0.138 | -0.095 |
| 2003-06-04 | -0.141 | -0.095 |
| 2003-06-05 | -0.143 | -0.097 |
| 2003-06-06 | -0.143 | -0.098 |
| 2003-06-09 | -0.14 | -0.096 |
| 2003-06-10 | -0.141 | -0.097 |
| 2003-06-11 | -0.143 | -0.099 |
| 2003-06-12 | -0.143 | -0.099 |
| 2003-06-13 | -0.141 | -0.098 |
| 2003-06-16 | -0.144 | -0.101 |
| 2003-06-17 | -0.147 | -0.104 |
| 2003-06-18 | -0.149 | -0.106 |
| 2003-06-19 | -0.146 | -0.102 |
| 2003-06-20 | -0.145 | -0.101 |
| 2003-06-23 | -0.142 | -0.097 |
| 2003-06-24 | -0.14 | -0.097 |
| 2003-06-25 | -0.141 | -0.099 |
| 2003-06-26 | -0.146 | -0.101 |
| 2003-06-27 | -0.145 | -0.102 |
| 2003-06-30 | -0.145 | -0.101 |
| 2003-07-01 | -0.144 | -0.103 |
| 2003-07-02 | -0.147 | -0.105 |
| 2003-07-03 | -0.147 | -0.104 |
| 2003-07-07 | -0.148 | -0.109 |
| 2003-07-08 | -0.151 | -0.11 |
| 2003-07-09 | -0.152 | -0.108 |
| 2003-07-10 | -0.15 | -0.108 |
| 2003-07-11 | -0.151 | -0.109 |
| 2003-07-14 | -0.151 | -0.113 |
| 2003-07-15 | -0.151 | -0.114 |
| 2003-07-16 | -0.151 | -0.112 |
| 2003-07-17 | -0.147 | -0.11 |
| 2003-07-18 | -0.147 | -0.11 |
| 2003-07-21 | -0.145 | -0.109 |
| 2003-07-22 | -0.147 | -0.112 |
| 2003-07-23 | -0.149 | -0.113 |
| 2003-07-24 | -0.149 | -0.113 |
| 2003-07-25 | -0.149 | -0.116 |
| 2003-07-28 | -0.149 | -0.117 |
| 2003-07-29 | -0.15 | -0.118 |
| 2003-07-30 | -0.151 | -0.117 |
| 2003-07-31 | -0.152 | -0.117 |
| 2003-08-01 | -0.15 | -0.117 |
| 2003-08-04 | -0.149 | -0.118 |
| 2003-08-05 | -0.148 | -0.115 |
| 2003-08-06 | -0.147 | -0.113 |
| 2003-08-07 | -0.147 | -0.111 |
| 2003-08-08 | -0.148 | -0.11 |
| 2003-08-11 | -0.149 | -0.11 |
| 2003-08-12 | -0.152 | -0.111 |
| 2003-08-13 | -0.153 | -0.111 |
| 2003-08-14 | -0.154 | -0.113 |
| 2003-08-15 | -0.155 | -0.113 |
| 2003-08-18 | -0.158 | -0.116 |
| 2003-08-19 | -0.162 | -0.12 |
| 2003-08-20 | -0.163 | -0.119 |
| 2003-08-21 | -0.166 | -0.121 |
| 2003-08-22 | -0.164 | -0.121 |
| 2003-08-25 | -0.163 | -0.12 |
| 2003-08-26 | -0.163 | -0.12 |
| 2003-08-27 | -0.165 | -0.122 |
| 2003-08-28 | -0.168 | -0.121 |
| 2003-08-29 | -0.169 | -0.123 |
| 2003-09-02 | -0.172 | -0.125 |
| 2003-09-03 | -0.175 | -0.126 |
| 2003-09-04 | -0.176 | -0.127 |
| 2003-09-05 | -0.174 | -0.128 |
| 2003-09-08 | -0.177 | -0.129 |
| 2003-09-09 | -0.176 | -0.13 |
| 2003-09-10 | -0.171 | -0.125 |
| 2003-09-11 | -0.172 | -0.126 |
| 2003-09-12 | -0.172 | -0.127 |
| 2003-09-15 | -0.172 | -0.126 |
| 2003-09-16 | -0.174 | -0.128 |
| 2003-09-17 | -0.174 | -0.126 |
| 2003-09-18 | -0.176 | -0.129 |
| 2003-09-19 | -0.176 | -0.131 |
| 2003-09-22 | -0.174 | -0.129 |
| 2003-09-23 | -0.176 | -0.128 |
| 2003-09-24 | -0.173 | -0.128 |
| 2003-09-25 | -0.169 | -0.125 |
| 2003-09-26 | -0.166 | -0.125 |
| 2003-09-29 | -0.168 | -0.127 |
| 2003-09-30 | -0.168 | -0.125 |
| 2003-10-01 | -0.174 | -0.129 |
| 2003-10-02 | -0.175 | -0.128 |
| 2003-10-03 | -0.178 | -0.13 |
| 2003-10-06 | -0.179 | -0.131 |
| 2003-10-07 | -0.18 | -0.132 |
| 2003-10-08 | -0.178 | -0.132 |
| 2003-10-09 | -0.18 | -0.133 |
| 2003-10-10 | -0.18 | -0.133 |
| 2003-10-13 | -0.184 | -0.135 |
| 2003-10-14 | -0.185 | -0.137 |
| 2003-10-15 | -0.182 | -0.137 |
| 2003-10-16 | -0.183 | -0.138 |
| 2003-10-17 | -0.18 | -0.138 |
| 2003-10-20 | -0.18 | -0.138 |
| 2003-10-21 | -0.182 | -0.137 |
| 2003-10-22 | -0.179 | -0.135 |
| 2003-10-23 | -0.179 | -0.136 |
| 2003-10-24 | -0.177 | -0.135 |
| 2003-10-27 | -0.181 | -0.134 |
| 2003-10-28 | -0.185 | -0.135 |
| 2003-10-29 | -0.188 | -0.136 |
| 2003-10-30 | -0.187 | -0.136 |
| 2003-10-31 | -0.186 | -0.136 |
| 2003-11-03 | -0.19 | -0.138 |
| 2003-11-04 | -0.191 | -0.138 |
| 2003-11-05 | -0.192 | -0.137 |
| 2003-11-06 | -0.194 | -0.14 |
| 2003-11-07 | -0.195 | -0.14 |
| 2003-11-10 | -0.191 | -0.139 |
| 2003-11-11 | -0.19 | -0.139 |
| 2003-11-12 | -0.193 | -0.14 |
| 2003-11-13 | -0.193 | -0.142 |
| 2003-11-14 | -0.189 | -0.141 |
| 2003-11-17 | -0.185 | -0.142 |
| 2003-11-18 | -0.184 | -0.141 |
| 2003-11-19 | -0.184 | -0.142 |
| 2003-11-20 | -0.184 | -0.14 |
| 2003-11-21 | -0.184 | -0.141 |
| 2003-11-24 | -0.188 | -0.142 |
| 2003-11-25 | -0.19 | -0.14 |
| 2003-11-26 | -0.19 | -0.14 |
| 2003-11-28 | -0.191 | -0.14 |
| 2003-12-01 | -0.194 | -0.141 |
| 2003-12-02 | -0.193 | -0.142 |
| 2003-12-03 | -0.19 | -0.145 |
| 2003-12-04 | -0.191 | -0.147 |
| 2003-12-05 | -0.19 | -0.144 |
| 2003-12-08 | -0.193 | -0.148 |
| 2003-12-09 | -0.191 | -0.148 |
| 2003-12-10 | -0.19 | -0.15 |
| 2003-12-11 | -0.195 | -0.149 |
| 2003-12-12 | -0.198 | -0.149 |
| 2003-12-15 | -0.193 | -0.15 |
| 2003-12-16 | -0.195 | -0.151 |
| 2003-12-17 | -0.196 | -0.151 |
| 2003-12-18 | -0.198 | -0.152 |
| 2003-12-19 | -0.199 | -0.152 |
| 2003-12-22 | -0.2 | -0.152 |
| 2003-12-23 | -0.201 | -0.153 |
| 2003-12-24 | -0.199 | -0.152 |
| 2003-12-26 | -0.2 | -0.152 |
| 2003-12-29 | -0.202 | -0.154 |
| 2003-12-30 | -0.203 | -0.155 |
| 2003-12-31 | -0.202 | -0.156 |
| 2004-01-02 | -0.202 | -0.154 |
| 2004-01-05 | -0.204 | -0.157 |
| 2004-01-06 | -0.204 | -0.155 |
| 2004-01-07 | -0.204 | -0.154 |
| 2004-01-08 | -0.204 | -0.152 |
| 2004-01-09 | -0.204 | -0.149 |
| 2004-01-12 | -0.205 | -0.15 |
| 2004-01-13 | -0.206 | -0.149 |
| 2004-01-14 | -0.21 | -0.151 |
| 2004-01-15 | -0.21 | -0.151 |
| 2004-01-16 | -0.208 | -0.15 |
| 2004-01-20 | -0.209 | -0.15 |
| 2004-01-21 | -0.211 | -0.15 |
| 2004-01-22 | -0.212 | -0.149 |
| 2004-01-23 | -0.212 | -0.149 |
| 2004-01-26 | -0.213 | -0.149 |
| 2004-01-27 | -0.214 | -0.148 |
| 2004-01-28 | -0.213 | -0.144 |
| 2004-01-29 | -0.214 | -0.143 |
| 2004-01-30 | -0.214 | -0.144 |
| 2004-02-02 | -0.216 | -0.143 |
| 2004-02-03 | -0.214 | -0.142 |
| 2004-02-04 | -0.213 | -0.14 |
| 2004-02-05 | -0.214 | -0.142 |
| 2004-02-06 | -0.215 | -0.145 |
| 2004-02-09 | -0.216 | -0.145 |
| 2004-02-10 | -0.218 | -0.146 |
| 2004-02-11 | -0.22 | -0.147 |
| 2004-02-12 | -0.219 | -0.146 |
| 2004-02-13 | -0.218 | -0.146 |
| 2004-02-17 | -0.22 | -0.149 |
| 2004-02-18 | -0.219 | -0.148 |
| 2004-02-19 | -0.219 | -0.146 |
| 2004-02-20 | -0.219 | -0.146 |
| 2004-02-23 | -0.218 | -0.143 |
| 2004-02-24 | -0.218 | -0.144 |
| 2004-02-25 | -0.22 | -0.147 |
| 2004-02-26 | -0.222 | -0.149 |
| 2004-02-27 | -0.223 | -0.15 |
| 2004-03-01 | -0.225 | -0.152 |
| 2004-03-02 | -0.226 | -0.152 |
| 2004-03-03 | -0.227 | -0.152 |
| 2004-03-04 | -0.225 | -0.153 |
| 2004-03-05 | -0.228 | -0.155 |
| 2004-03-08 | -0.23 | -0.153 |
| 2004-03-09 | -0.231 | -0.152 |
| 2004-03-10 | -0.229 | -0.15 |
| 2004-03-11 | -0.226 | -0.149 |
| 2004-03-12 | -0.228 | -0.152 |
| 2004-03-15 | -0.227 | -0.149 |
| 2004-03-16 | -0.226 | -0.15 |
| 2004-03-17 | -0.227 | -0.149 |
| 2004-03-18 | -0.229 | -0.15 |
| 2004-03-19 | -0.229 | -0.153 |
| 2004-03-22 | -0.227 | -0.151 |
| 2004-03-23 | -0.226 | -0.152 |
| 2004-03-24 | -0.224 | -0.148 |
| 2004-03-25 | -0.224 | -0.146 |
| 2004-03-26 | -0.226 | -0.147 |
| 2004-03-29 | -0.227 | -0.148 |
| 2004-03-30 | -0.23 | -0.15 |
| 2004-03-31 | -0.232 | -0.153 |
| 2004-04-01 | -0.23 | -0.151 |
| 2004-04-02 | -0.227 | -0.146 |
| 2004-04-05 | -0.227 | -0.142 |
| 2004-04-06 | -0.228 | -0.141 |
| 2004-04-07 | -0.23 | -0.142 |
| 2004-04-08 | -0.227 | -0.138 |
| 2004-04-12 | -0.229 | -0.135 |
| 2004-04-13 | -0.226 | -0.134 |
| 2004-04-14 | -0.225 | -0.133 |
| 2004-04-15 | -0.231 | -0.139 |
| 2004-04-16 | -0.234 | -0.147 |
| 2004-04-19 | -0.234 | -0.141 |
| 2004-04-20 | -0.232 | -0.142 |
| 2004-04-21 | -0.232 | -0.137 |
| 2004-04-22 | -0.234 | -0.14 |
| 2004-04-23 | -0.234 | -0.136 |
| 2004-04-26 | -0.235 | -0.14 |
| 2004-04-27 | -0.238 | -0.148 |
| 2004-04-28 | -0.236 | -0.15 |
| 2004-04-29 | -0.233 | -0.152 |
| 2004-04-30 | -0.233 | -0.158 |
| 2004-05-03 | -0.235 | -0.16 |
| 2004-05-04 | -0.235 | -0.157 |
| 2004-05-05 | -0.235 | -0.156 |
| 2004-05-06 | -0.233 | -0.155 |
| 2004-05-07 | -0.225 | -0.149 |
| 2004-05-10 | -0.22 | -0.148 |
| 2004-05-11 | -0.222 | -0.146 |
| 2004-05-12 | -0.223 | -0.148 |
| 2004-05-13 | -0.222 | -0.148 |
| 2004-05-14 | -0.225 | -0.153 |
| 2004-05-17 | -0.222 | -0.153 |
| 2004-05-18 | -0.223 | -0.152 |
| 2004-05-19 | -0.224 | -0.15 |
| 2004-05-20 | -0.224 | -0.151 |
| 2004-05-21 | -0.226 | -0.152 |
| 2004-05-24 | -0.23 | -0.153 |
| 2004-05-25 | -0.233 | -0.154 |
| 2004-05-26 | -0.234 | -0.153 |
| 2004-05-27 | -0.234 | -0.152 |
| 2004-05-28 | -0.236 | -0.152 |
| 2004-06-01 | -0.237 | -0.153 |
| 2004-06-02 | -0.238 | -0.157 |
| 2004-06-03 | -0.235 | -0.158 |
| 2004-06-04 | -0.236 | -0.157 |
| 2004-06-07 | -0.241 | -0.158 |
| 2004-06-08 | -0.241 | -0.158 |
| 2004-06-09 | -0.239 | -0.159 |
| 2004-06-10 | -0.24 | -0.16 |
| 2004-06-14 | -0.236 | -0.159 |
| 2004-06-15 | -0.239 | -0.161 |
| 2004-06-16 | -0.241 | -0.164 |
| 2004-06-17 | -0.243 | -0.165 |
| 2004-06-18 | -0.243 | -0.164 |
| 2004-06-21 | -0.242 | -0.165 |
| 2004-06-22 | -0.243 | -0.165 |
| 2004-06-23 | -0.247 | -0.167 |
| 2004-06-24 | -0.246 | -0.167 |
| 2004-06-25 | -0.245 | -0.166 |
| 2004-06-28 | -0.245 | -0.165 |
| 2004-06-29 | -0.246 | -0.165 |
| 2004-06-30 | -0.248 | -0.167 |
| 2004-07-01 | -0.243 | -0.167 |
| 2004-07-02 | -0.242 | -0.169 |
| 2004-07-06 | -0.236 | -0.167 |
| 2004-07-07 | -0.236 | -0.166 |
| 2004-07-08 | -0.231 | -0.165 |
| 2004-07-09 | -0.232 | -0.165 |
| 2004-07-12 | -0.23 | -0.165 |
| 2004-07-13 | -0.23 | -0.164 |
| 2004-07-14 | -0.23 | -0.166 |
| 2004-07-15 | -0.23 | -0.165 |
| 2004-07-16 | -0.225 | -0.164 |
| 2004-07-19 | -0.225 | -0.163 |
| 2004-07-20 | -0.23 | -0.164 |
| 2004-07-21 | -0.225 | -0.158 |
| 2004-07-22 | -0.226 | -0.159 |
| 2004-07-23 | -0.221 | -0.156 |
| 2004-07-26 | -0.219 | -0.152 |
| 2004-07-27 | -0.222 | -0.156 |
| 2004-07-28 | -0.22 | -0.157 |
| 2004-07-29 | -0.222 | -0.158 |
| 2004-07-30 | -0.223 | -0.16 |
| 2004-08-02 | -0.223 | -0.157 |
| 2004-08-03 | -0.22 | -0.157 |
| 2004-08-04 | -0.219 | -0.153 |
| 2004-08-05 | -0.216 | -0.15 |
| 2004-08-06 | -0.212 | -0.147 |
| 2004-08-09 | -0.211 | -0.149 |
| 2004-08-10 | -0.215 | -0.149 |
| 2004-08-11 | -0.212 | -0.149 |
| 2004-08-12 | -0.207 | -0.147 |
| 2004-08-13 | -0.208 | -0.146 |
| 2004-08-16 | -0.211 | -0.147 |
| 2004-08-17 | -0.212 | -0.146 |
| 2004-08-18 | -0.214 | -0.148 |
| 2004-08-19 | -0.214 | -0.15 |
| 2004-08-20 | -0.216 | -0.151 |
| 2004-08-23 | -0.216 | -0.15 |
| 2004-08-24 | -0.216 | -0.149 |
| 2004-08-25 | -0.218 | -0.151 |
| 2004-08-26 | -0.219 | -0.151 |
| 2004-08-27 | -0.219 | -0.154 |
| 2004-08-30 | -0.219 | -0.151 |
| 2004-08-31 | -0.219 | -0.153 |
| 2004-09-01 | -0.221 | -0.155 |
| 2004-09-02 | -0.223 | -0.158 |
| 2004-09-03 | -0.223 | -0.158 |
| 2004-09-07 | -0.223 | -0.157 |
| 2004-09-08 | -0.222 | -0.158 |
| 2004-09-09 | -0.225 | -0.158 |
| 2004-09-10 | -0.226 | -0.16 |
| 2004-09-13 | -0.228 | -0.161 |
| 2004-09-14 | -0.229 | -0.163 |
| 2004-09-15 | -0.227 | -0.162 |
| 2004-09-16 | -0.228 | -0.162 |
| 2004-09-17 | -0.23 | -0.163 |
| 2004-09-20 | -0.229 | -0.163 |
| 2004-09-21 | -0.232 | -0.165 |
| 2004-09-22 | -0.229 | -0.16 |
| 2004-09-23 | -0.23 | -0.163 |
| 2004-09-24 | -0.233 | -0.161 |
| 2004-09-27 | -0.231 | -0.158 |
| 2004-09-28 | -0.231 | -0.157 |
| 2004-09-29 | -0.231 | -0.16 |
| 2004-09-30 | -0.231 | -0.162 |
| 2004-10-01 | -0.236 | -0.167 |
| 2004-10-04 | -0.235 | -0.169 |
| 2004-10-05 | -0.236 | -0.171 |
| 2004-10-06 | -0.239 | -0.171 |
| 2004-10-07 | -0.238 | -0.171 |
| 2004-10-08 | -0.238 | -0.17 |
| 2004-10-11 | -0.237 | -0.17 |
| 2004-10-12 | -0.237 | -0.166 |
| 2004-10-13 | -0.234 | -0.163 |
| 2004-10-14 | -0.232 | -0.161 |
| 2004-10-15 | -0.232 | -0.161 |
| 2004-10-18 | -0.231 | -0.16 |
| 2004-10-19 | -0.231 | -0.16 |
| 2004-10-20 | -0.231 | -0.162 |
| 2004-10-21 | -0.233 | -0.163 |
| 2004-10-22 | -0.232 | -0.163 |
| 2004-10-25 | -0.232 | -0.164 |
| 2004-10-26 | -0.237 | -0.165 |
| 2004-10-27 | -0.238 | -0.163 |
| 2004-10-28 | -0.237 | -0.162 |
| 2004-10-29 | -0.238 | -0.165 |
| 2004-11-01 | -0.238 | -0.168 |
| 2004-11-02 | -0.237 | -0.168 |
| 2004-11-03 | -0.239 | -0.168 |
| 2004-11-04 | -0.24 | -0.172 |
| 2004-11-05 | -0.241 | -0.172 |
| 2004-11-08 | -0.239 | -0.172 |
| 2004-11-09 | -0.238 | -0.172 |
| 2004-11-10 | -0.241 | -0.173 |
| 2004-11-11 | -0.242 | -0.175 |
| 2004-11-12 | -0.244 | -0.175 |
| 2004-11-15 | -0.242 | -0.174 |
| 2004-11-16 | -0.241 | -0.173 |
| 2004-11-17 | -0.244 | -0.173 |
| 2004-11-18 | -0.246 | -0.174 |
| 2004-11-19 | -0.244 | -0.171 |
| 2004-11-22 | -0.244 | -0.172 |
| 2004-11-23 | -0.244 | -0.172 |
| 2004-11-24 | -0.246 | -0.173 |
| 2004-11-26 | -0.246 | -0.174 |
| 2004-11-29 | -0.245 | -0.173 |
| 2004-11-30 | -0.244 | -0.172 |
| 2004-12-01 | -0.245 | -0.173 |
| 2004-12-02 | -0.245 | -0.171 |
| 2004-12-03 | -0.245 | -0.171 |
| 2004-12-06 | -0.244 | -0.17 |
| 2004-12-07 | -0.242 | -0.17 |
| 2004-12-08 | -0.244 | -0.171 |
| 2004-12-09 | -0.245 | -0.171 |
| 2004-12-10 | -0.245 | -0.17 |
| 2004-12-13 | -0.248 | -0.172 |
| 2004-12-14 | -0.25 | -0.173 |
| 2004-12-15 | -0.252 | -0.175 |
| 2004-12-16 | -0.251 | -0.174 |
| 2004-12-17 | -0.251 | -0.173 |
| 2004-12-20 | -0.251 | -0.173 |
| 2004-12-21 | -0.254 | -0.174 |
| 2004-12-22 | -0.254 | -0.174 |
| 2004-12-23 | -0.254 | -0.174 |
| 2004-12-27 | -0.253 | -0.172 |
| 2004-12-28 | -0.257 | -0.174 |
| 2004-12-29 | -0.256 | -0.175 |
| 2004-12-30 | -0.256 | -0.174 |
| 2004-12-31 | -0.256 | -0.174 |
| 2005-01-03 | -0.253 | -0.173 |
| 2005-01-04 | -0.249 | -0.171 |
| 2005-01-05 | -0.246 | -0.17 |
| 2005-01-06 | -0.246 | -0.173 |
| 2005-01-07 | -0.245 | -0.171 |
| 2005-01-10 | -0.247 | -0.172 |
| 2005-01-11 | -0.246 | -0.17 |
| 2005-01-12 | -0.246 | -0.172 |
| 2005-01-13 | -0.244 | -0.17 |
| 2005-01-14 | -0.246 | -0.171 |
| 2005-01-18 | -0.247 | -0.172 |
| 2005-01-19 | -0.246 | -0.172 |
| 2005-01-20 | -0.245 | -0.171 |
| 2005-01-21 | -0.245 | -0.17 |
| 2005-01-24 | -0.245 | -0.172 |
| 2005-01-25 | -0.245 | -0.173 |
| 2005-01-26 | -0.246 | -0.172 |
| 2005-01-27 | -0.248 | -0.172 |
| 2005-01-28 | -0.246 | -0.171 |
| 2005-01-31 | -0.248 | -0.173 |
| 2005-02-01 | -0.249 | -0.173 |
| 2005-02-02 | -0.249 | -0.173 |
| 2005-02-03 | -0.247 | -0.172 |
| 2005-02-04 | -0.251 | -0.174 |
| 2005-02-07 | -0.252 | -0.175 |
| 2005-02-08 | -0.253 | -0.174 |
| 2005-02-09 | -0.248 | -0.173 |
| 2005-02-10 | -0.246 | -0.176 |
| 2005-02-11 | -0.247 | -0.177 |
| 2005-02-14 | -0.247 | -0.176 |
| 2005-02-15 | -0.248 | -0.177 |
| 2005-02-16 | -0.247 | -0.177 |
| 2005-02-17 | -0.246 | -0.176 |
| 2005-02-18 | -0.246 | -0.175 |
| 2005-02-22 | -0.243 | -0.172 |
| 2005-02-23 | -0.242 | -0.171 |
| 2005-02-24 | -0.242 | -0.171 |
| 2005-02-25 | -0.244 | -0.173 |
| 2005-02-28 | -0.245 | -0.175 |
| 2005-03-01 | -0.248 | -0.176 |
| 2005-03-02 | -0.247 | -0.175 |
| 2005-03-03 | -0.247 | -0.176 |
| 2005-03-04 | -0.248 | -0.177 |
| 2005-03-07 | -0.247 | -0.177 |
| 2005-03-08 | -0.246 | -0.175 |
| 2005-03-09 | -0.244 | -0.172 |
| 2005-03-10 | -0.244 | -0.17 |
| 2005-03-11 | -0.244 | -0.171 |
| 2005-03-14 | -0.246 | -0.172 |
| 2005-03-15 | -0.245 | -0.172 |
| 2005-03-16 | -0.243 | -0.172 |
| 2005-03-17 | -0.242 | -0.171 |
| 2005-03-18 | -0.241 | -0.17 |
| 2005-03-21 | -0.241 | -0.171 |
| 2005-03-22 | -0.238 | -0.17 |
| 2005-03-23 | -0.241 | -0.165 |
| 2005-03-24 | -0.241 | -0.167 |
| 2005-03-28 | -0.242 | -0.167 |
| 2005-03-29 | -0.242 | -0.163 |
| 2005-03-30 | -0.245 | -0.164 |
| 2005-03-31 | -0.242 | -0.165 |
| 2005-04-01 | -0.237 | -0.166 |
| 2005-04-04 | -0.238 | -0.166 |
| 2005-04-05 | -0.241 | -0.166 |
| 2005-04-06 | -0.239 | -0.166 |
| 2005-04-07 | -0.242 | -0.166 |
| 2005-04-08 | -0.24 | -0.165 |
| 2005-04-11 | -0.239 | -0.163 |
| 2005-04-12 | -0.243 | -0.162 |
| 2005-04-13 | -0.242 | -0.159 |
| 2005-04-14 | -0.24 | -0.156 |
| 2005-04-15 | -0.239 | -0.15 |
| 2005-04-18 | -0.238 | -0.15 |
| 2005-04-19 | -0.238 | -0.15 |
| 2005-04-20 | -0.235 | -0.15 |
| 2005-04-21 | -0.239 | -0.152 |
| 2005-04-22 | -0.235 | -0.149 |
| 2005-04-25 | -0.237 | -0.149 |
| 2005-04-26 | -0.235 | -0.148 |
| 2005-04-27 | -0.239 | -0.149 |
| 2005-04-28 | -0.238 | -0.148 |
| 2005-04-29 | -0.241 | -0.149 |
| 2005-05-02 | -0.241 | -0.148 |
| 2005-05-03 | -0.241 | -0.149 |
| 2005-05-04 | -0.245 | -0.153 |
| 2005-05-05 | -0.244 | -0.151 |
| 2005-05-06 | -0.244 | -0.151 |
| 2005-05-09 | -0.245 | -0.152 |
| 2005-05-10 | -0.243 | -0.15 |
| 2005-05-11 | -0.242 | -0.151 |
| 2005-05-12 | -0.242 | -0.153 |
| 2005-05-13 | -0.241 | -0.156 |
| 2005-05-16 | -0.244 | -0.158 |
| 2005-05-17 | -0.244 | -0.158 |
| 2005-05-18 | -0.247 | -0.161 |
| 2005-05-19 | -0.247 | -0.163 |
| 2005-05-20 | -0.247 | -0.165 |
| 2005-05-23 | -0.246 | -0.165 |
| 2005-05-24 | -0.246 | -0.165 |
| 2005-05-25 | -0.245 | -0.164 |
| 2005-05-26 | -0.247 | -0.165 |
| 2005-05-27 | -0.247 | -0.166 |
| 2005-05-31 | -0.246 | -0.165 |
| 2005-06-01 | -0.248 | -0.166 |
| 2005-06-02 | -0.249 | -0.167 |
| 2005-06-03 | -0.249 | -0.166 |
| 2005-06-06 | -0.249 | -0.168 |
| 2005-06-07 | -0.249 | -0.169 |
| 2005-06-08 | -0.249 | -0.169 |
| 2005-06-09 | -0.25 | -0.172 |
| 2005-06-10 | -0.251 | -0.172 |
| 2005-06-13 | -0.253 | -0.172 |
| 2005-06-14 | -0.254 | -0.174 |
| 2005-06-15 | -0.255 | -0.175 |
| 2005-06-16 | -0.255 | -0.176 |
| 2005-06-17 | -0.254 | -0.177 |
| 2005-06-20 | -0.255 | -0.177 |
| 2005-06-21 | -0.256 | -0.177 |
| 2005-06-22 | -0.256 | -0.178 |
| 2005-06-23 | -0.253 | -0.176 |
| 2005-06-24 | -0.251 | -0.174 |
| 2005-06-27 | -0.251 | -0.174 |
| 2005-06-28 | -0.255 | -0.175 |
| 2005-06-29 | -0.256 | -0.177 |
| 2005-06-30 | -0.256 | -0.177 |
| 2005-07-01 | -0.258 | -0.178 |
| 2005-07-05 | -0.261 | -0.178 |
| 2005-07-06 | -0.258 | -0.178 |
| 2005-07-07 | -0.258 | -0.177 |
| 2005-07-08 | -0.261 | -0.179 |
| 2005-07-11 | -0.263 | -0.181 |
| 2005-07-12 | -0.263 | -0.181 |
| 2005-07-13 | -0.261 | -0.181 |
| 2005-07-14 | -0.259 | -0.18 |
| 2005-07-15 | -0.259 | -0.18 |
| 2005-07-18 | -0.258 | -0.18 |
| 2005-07-19 | -0.261 | -0.182 |
| 2005-07-20 | -0.263 | -0.181 |
| 2005-07-21 | -0.258 | -0.179 |
| 2005-07-22 | -0.262 | -0.182 |
| 2005-07-25 | -0.26 | -0.18 |
| 2005-07-26 | -0.26 | -0.181 |
| 2005-07-27 | -0.26 | -0.181 |
| 2005-07-28 | -0.261 | -0.182 |
| 2005-07-29 | -0.26 | -0.182 |
| 2005-08-01 | -0.26 | -0.183 |
| 2005-08-02 | -0.259 | -0.185 |
| 2005-08-03 | -0.259 | -0.184 |
| 2005-08-04 | -0.255 | -0.181 |
| 2005-08-05 | -0.251 | -0.178 |
| 2005-08-08 | -0.248 | -0.177 |
| 2005-08-09 | -0.251 | -0.177 |
| 2005-08-10 | -0.248 | -0.175 |
| 2005-08-11 | -0.251 | -0.176 |
| 2005-08-12 | -0.248 | -0.175 |
| 2005-08-15 | -0.251 | -0.176 |
| 2005-08-16 | -0.249 | -0.175 |
| 2005-08-17 | -0.25 | -0.173 |
| 2005-08-18 | -0.248 | -0.174 |
| 2005-08-19 | -0.249 | -0.176 |
| 2005-08-22 | -0.25 | -0.178 |
| 2005-08-23 | -0.25 | -0.179 |
| 2005-08-24 | -0.248 | -0.179 |
| 2005-08-25 | -0.249 | -0.179 |
| 2005-08-26 | -0.247 | -0.177 |
| 2005-08-29 | -0.247 | -0.178 |
| 2005-08-30 | -0.246 | -0.179 |
| 2005-08-31 | -0.247 | -0.18 |
| 2005-09-01 | -0.247 | -0.182 |
| 2005-09-02 | -0.248 | -0.181 |
| 2005-09-06 | -0.25 | -0.183 |
| 2005-09-07 | -0.251 | -0.182 |
| 2005-09-08 | -0.25 | -0.181 |
| 2005-09-09 | -0.251 | -0.181 |
| 2005-09-12 | -0.253 | -0.182 |
| 2005-09-13 | -0.251 | -0.181 |
| 2005-09-14 | -0.25 | -0.181 |
| 2005-09-15 | -0.249 | -0.18 |
| 2005-09-16 | -0.251 | -0.182 |
| 2005-09-19 | -0.249 | -0.187 |
| 2005-09-20 | -0.249 | -0.186 |
| 2005-09-21 | -0.246 | -0.19 |
| 2005-09-22 | -0.247 | -0.185 |
| 2005-09-23 | -0.248 | -0.182 |
| 2005-09-26 | -0.249 | -0.185 |
| 2005-09-27 | -0.248 | -0.183 |
| 2005-09-28 | -0.247 | -0.185 |
| 2005-09-29 | -0.25 | -0.186 |
| 2005-09-30 | -0.251 | -0.184 |
| 2005-10-03 | -0.249 | -0.183 |
| 2005-10-04 | -0.25 | -0.181 |
| 2005-10-05 | -0.248 | -0.176 |
| 2005-10-06 | -0.248 | -0.172 |
| 2005-10-07 | -0.25 | -0.175 |
| 2005-10-10 | -0.25 | -0.175 |
| 2005-10-11 | -0.248 | -0.178 |
| 2005-10-12 | -0.245 | -0.176 |
| 2005-10-13 | -0.245 | -0.172 |
| 2005-10-14 | -0.247 | -0.173 |
| 2005-10-17 | -0.244 | -0.171 |
| 2005-10-18 | -0.249 | -0.172 |
| 2005-10-19 | -0.25 | -0.169 |
| 2005-10-20 | -0.25 | -0.169 |
| 2005-10-21 | -0.25 | -0.167 |
| 2005-10-24 | -0.249 | -0.168 |
| 2005-10-25 | -0.245 | -0.169 |
| 2005-10-26 | -0.243 | -0.17 |
| 2005-10-27 | -0.245 | -0.172 |
| 2005-10-28 | -0.247 | -0.172 |
| 2005-10-31 | -0.249 | -0.171 |
| 2005-11-01 | -0.249 | -0.171 |
| 2005-11-02 | -0.249 | -0.173 |
| 2005-11-03 | -0.248 | -0.169 |
| 2005-11-04 | -0.252 | -0.172 |
| 2005-11-07 | -0.255 | -0.174 |
| 2005-11-08 | -0.254 | -0.173 |
| 2005-11-09 | -0.257 | -0.174 |
| 2005-11-10 | -0.265 | -0.177 |
| 2005-11-11 | -0.266 | -0.179 |
| 2005-11-14 | -0.265 | -0.179 |
| 2005-11-15 | -0.263 | -0.176 |
| 2005-11-16 | -0.259 | -0.176 |
| 2005-11-17 | -0.262 | -0.178 |
| 2005-11-18 | -0.265 | -0.18 |
| 2005-11-21 | -0.266 | -0.18 |
| 2005-11-22 | -0.264 | -0.179 |
| 2005-11-23 | -0.268 | -0.181 |
| 2005-11-25 | -0.267 | -0.181 |
| 2005-11-28 | -0.267 | -0.182 |
| 2005-11-29 | -0.267 | -0.183 |
| 2005-11-30 | -0.268 | -0.185 |
| 2005-12-01 | -0.268 | -0.186 |
| 2005-12-02 | -0.268 | -0.186 |
| 2005-12-05 | -0.267 | -0.186 |
| 2005-12-06 | -0.267 | -0.185 |
| 2005-12-07 | -0.267 | -0.185 |
| 2005-12-08 | -0.263 | -0.185 |
| 2005-12-09 | -0.266 | -0.187 |
| 2005-12-12 | -0.265 | -0.188 |
| 2005-12-13 | -0.267 | -0.189 |
| 2005-12-14 | -0.268 | -0.188 |
| 2005-12-15 | -0.268 | -0.188 |
| 2005-12-16 | -0.271 | -0.187 |
| 2005-12-19 | -0.271 | -0.185 |
| 2005-12-20 | -0.268 | -0.184 |
| 2005-12-21 | -0.269 | -0.187 |
| 2005-12-22 | -0.271 | -0.19 |
| 2005-12-23 | -0.273 | -0.191 |
| 2005-12-27 | -0.273 | -0.19 |
| 2005-12-28 | -0.273 | -0.19 |
| 2005-12-29 | -0.273 | -0.19 |
| 2005-12-30 | -0.27 | -0.189 |
| 2006-01-03 | -0.268 | -0.19 |
| 2006-01-04 | -0.269 | -0.192 |
| 2006-01-05 | -0.27 | -0.193 |
| 2006-01-06 | -0.271 | -0.193 |
| 2006-01-09 | -0.27 | -0.194 |
| 2006-01-10 | -0.269 | -0.194 |
| 2006-01-11 | -0.269 | -0.193 |
| 2006-01-12 | -0.269 | -0.192 |
| 2006-01-13 | -0.268 | -0.193 |
| 2006-01-17 | -0.265 | -0.191 |
| 2006-01-18 | -0.266 | -0.189 |
| 2006-01-19 | -0.266 | -0.193 |
| 2006-01-20 | -0.261 | -0.191 |
| 2006-01-23 | -0.261 | -0.192 |
| 2006-01-24 | -0.26 | -0.196 |
| 2006-01-25 | -0.263 | -0.195 |
| 2006-01-26 | -0.264 | -0.198 |
| 2006-01-27 | -0.264 | -0.198 |
| 2006-01-30 | -0.261 | -0.198 |
| 2006-01-31 | -0.258 | -0.201 |
| 2006-02-01 | -0.261 | -0.2 |
| 2006-02-02 | -0.259 | -0.197 |
| 2006-02-03 | -0.259 | -0.195 |
| 2006-02-06 | -0.256 | -0.193 |
| 2006-02-07 | -0.261 | -0.191 |
| 2006-02-08 | -0.263 | -0.192 |
| 2006-02-09 | -0.263 | -0.192 |
| 2006-02-10 | -0.266 | -0.192 |
| 2006-02-13 | -0.264 | -0.189 |
| 2006-02-14 | -0.269 | -0.191 |
| 2006-02-15 | -0.272 | -0.193 |
| 2006-02-16 | -0.273 | -0.193 |
| 2006-02-17 | -0.272 | -0.19 |
| 2006-02-21 | -0.266 | -0.186 |
| 2006-02-22 | -0.271 | -0.191 |
| 2006-02-23 | -0.271 | -0.191 |
| 2006-02-24 | -0.272 | -0.192 |
| 2006-02-27 | -0.278 | -0.198 |
| 2006-02-28 | -0.274 | -0.195 |
| 2006-03-01 | -0.276 | -0.194 |
| 2006-03-02 | -0.274 | -0.192 |
| 2006-03-03 | -0.274 | -0.192 |
| 2006-03-06 | -0.275 | -0.193 |
| 2006-03-07 | -0.274 | -0.193 |
| 2006-03-08 | -0.274 | -0.193 |
| 2006-03-09 | -0.273 | -0.193 |
| 2006-03-10 | -0.273 | -0.192 |
| 2006-03-13 | -0.273 | -0.192 |
| 2006-03-14 | -0.273 | -0.192 |
| 2006-03-15 | -0.275 | -0.192 |
| 2006-03-16 | -0.271 | -0.192 |
| 2006-03-17 | -0.273 | -0.192 |
| 2006-03-20 | -0.276 | -0.194 |
| 2006-03-21 | -0.274 | -0.192 |
| 2006-03-22 | -0.274 | -0.192 |
| 2006-03-23 | -0.272 | -0.19 |
| 2006-03-24 | -0.271 | -0.191 |
| 2006-03-27 | -0.27 | -0.192 |
| 2006-03-28 | -0.266 | -0.19 |
| 2006-03-29 | -0.266 | -0.191 |
| 2006-03-30 | -0.267 | -0.191 |
| 2006-03-31 | -0.268 | -0.191 |
| 2006-04-03 | -0.268 | -0.191 |
| 2006-04-04 | -0.268 | -0.192 |
| 2006-04-05 | -0.267 | -0.192 |
| 2006-04-06 | -0.265 | -0.191 |
| 2006-04-07 | -0.264 | -0.19 |
| 2006-04-10 | -0.261 | -0.19 |
| 2006-04-11 | -0.26 | -0.189 |
| 2006-04-12 | -0.261 | -0.189 |
| 2006-04-13 | -0.261 | -0.188 |
| 2006-04-17 | -0.26 | -0.187 |
| 2006-04-18 | -0.263 | -0.191 |
| 2006-04-19 | -0.264 | -0.189 |
| 2006-04-20 | -0.265 | -0.19 |
| 2006-04-21 | -0.264 | -0.189 |
| 2006-04-24 | -0.263 | -0.188 |
| 2006-04-25 | -0.261 | -0.187 |
| 2006-04-26 | -0.261 | -0.189 |
| 2006-04-27 | -0.261 | -0.19 |
| 2006-04-28 | -0.259 | -0.189 |
| 2006-05-01 | -0.255 | -0.187 |
| 2006-05-02 | -0.256 | -0.188 |
| 2006-05-03 | -0.255 | -0.184 |
| 2006-05-04 | -0.257 | -0.185 |
| 2006-05-05 | -0.26 | -0.186 |
| 2006-05-08 | -0.259 | -0.186 |
| 2006-05-09 | -0.258 | -0.184 |
| 2006-05-10 | -0.255 | -0.184 |
| 2006-05-11 | -0.25 | -0.183 |
| 2006-05-12 | -0.247 | -0.182 |
| 2006-05-15 | -0.247 | -0.184 |
| 2006-05-16 | -0.247 | -0.185 |
| 2006-05-17 | -0.245 | -0.186 |
| 2006-05-18 | -0.245 | -0.187 |
| 2006-05-19 | -0.245 | -0.187 |
| 2006-05-22 | -0.246 | -0.187 |
| 2006-05-23 | -0.242 | -0.185 |
| 2006-05-24 | -0.246 | -0.186 |
| 2006-05-25 | -0.25 | -0.187 |
| 2006-05-26 | -0.251 | -0.186 |
| 2006-05-30 | -0.247 | -0.185 |
| 2006-05-31 | -0.248 | -0.187 |
| 2006-06-01 | -0.253 | -0.188 |
| 2006-06-02 | -0.252 | -0.188 |
| 2006-06-05 | -0.248 | -0.184 |
| 2006-06-06 | -0.248 | -0.184 |
| 2006-06-07 | -0.25 | -0.186 |
| 2006-06-08 | -0.25 | -0.186 |
| 2006-06-09 | -0.249 | -0.184 |
| 2006-06-12 | -0.246 | -0.181 |
| 2006-06-13 | -0.243 | -0.182 |
| 2006-06-14 | -0.241 | -0.182 |
| 2006-06-15 | -0.244 | -0.182 |
| 2006-06-16 | -0.241 | -0.181 |
| 2006-06-19 | -0.239 | -0.181 |
| 2006-06-20 | -0.239 | -0.181 |
| 2006-06-21 | -0.24 | -0.179 |
| 2006-06-22 | -0.238 | -0.178 |
| 2006-06-23 | -0.237 | -0.178 |
| 2006-06-26 | -0.24 | -0.178 |
| 2006-06-27 | -0.237 | -0.175 |
| 2006-06-28 | -0.236 | -0.175 |
| 2006-06-29 | -0.243 | -0.175 |
| 2006-06-30 | -0.244 | -0.173 |
| 2006-07-03 | -0.246 | -0.174 |
| 2006-07-05 | -0.242 | -0.171 |
| 2006-07-06 | -0.243 | -0.172 |
| 2006-07-07 | -0.241 | -0.171 |
| 2006-07-10 | -0.239 | -0.168 |
| 2006-07-11 | -0.239 | -0.168 |
| 2006-07-12 | -0.236 | -0.165 |
| 2006-07-13 | -0.232 | -0.167 |
| 2006-07-14 | -0.231 | -0.165 |
| 2006-07-17 | -0.231 | -0.17 |
| 2006-07-18 | -0.231 | -0.17 |
| 2006-07-19 | -0.24 | -0.171 |
| 2006-07-20 | -0.234 | -0.178 |
| 2006-07-21 | -0.23 | -0.18 |
| 2006-07-24 | -0.234 | -0.179 |
| 2006-07-25 | -0.236 | -0.179 |
| 2006-07-26 | -0.234 | -0.177 |
| 2006-07-27 | -0.23 | -0.175 |
| 2006-07-28 | -0.235 | -0.177 |
| 2006-07-31 | -0.235 | -0.176 |
| 2006-08-01 | -0.231 | -0.173 |
| 2006-08-02 | -0.235 | -0.176 |
| 2006-08-03 | -0.239 | -0.177 |
| 2006-08-04 | -0.238 | -0.181 |
| 2006-08-07 | -0.237 | -0.179 |
| 2006-08-08 | -0.234 | -0.178 |
| 2006-08-09 | -0.232 | -0.177 |
| 2006-08-10 | -0.235 | -0.182 |
| 2006-08-11 | -0.233 | -0.183 |
| 2006-08-14 | -0.235 | -0.188 |
| 2006-08-15 | -0.239 | -0.192 |
| 2006-08-16 | -0.244 | -0.192 |
| 2006-08-17 | -0.249 | -0.197 |
| 2006-08-18 | -0.246 | -0.194 |
| 2006-08-21 | -0.242 | -0.191 |
| 2006-08-22 | -0.241 | -0.191 |
| 2006-08-23 | -0.241 | -0.191 |
| 2006-08-24 | -0.241 | -0.191 |
| 2006-08-25 | -0.239 | -0.19 |
| 2006-08-28 | -0.246 | -0.194 |
| 2006-08-29 | -0.25 | -0.196 |
| 2006-08-30 | -0.257 | -0.2 |
| 2006-08-31 | -0.257 | -0.199 |
| 2006-09-01 | -0.256 | -0.198 |
| 2006-09-05 | -0.257 | -0.2 |
| 2006-09-06 | -0.256 | -0.198 |
| 2006-09-07 | -0.254 | -0.196 |
| 2006-09-08 | -0.259 | -0.198 |
| 2006-09-11 | -0.264 | -0.201 |
| 2006-09-12 | -0.272 | -0.206 |
| 2006-09-13 | -0.271 | -0.207 |
| 2006-09-14 | -0.272 | -0.206 |
| 2006-09-15 | -0.273 | -0.207 |
| 2006-09-18 | -0.27 | -0.205 |
| 2006-09-19 | -0.27 | -0.204 |
| 2006-09-20 | -0.274 | -0.206 |
| 2006-09-21 | -0.271 | -0.206 |
| 2006-09-22 | -0.27 | -0.204 |
| 2006-09-25 | -0.273 | -0.205 |
| 2006-09-26 | -0.275 | -0.206 |
| 2006-09-27 | -0.272 | -0.205 |
| 2006-09-28 | -0.274 | -0.205 |
| 2006-09-29 | -0.273 | -0.205 |
| 2006-10-02 | -0.272 | -0.203 |
| 2006-10-03 | -0.275 | -0.202 |
| 2006-10-04 | -0.276 | -0.206 |
| 2006-10-05 | -0.277 | -0.21 |
| 2006-10-06 | -0.276 | -0.209 |
| 2006-10-09 | -0.276 | -0.21 |
| 2006-10-10 | -0.277 | -0.208 |
| 2006-10-11 | -0.276 | -0.207 |
| 2006-10-12 | -0.278 | -0.21 |
| 2006-10-13 | -0.278 | -0.212 |
| 2006-10-16 | -0.28 | -0.215 |
| 2006-10-17 | -0.279 | -0.213 |
| 2006-10-18 | -0.281 | -0.212 |
| 2006-10-19 | -0.281 | -0.214 |
| 2006-10-20 | -0.28 | -0.211 |
| 2006-10-23 | -0.282 | -0.21 |
| 2006-10-24 | -0.283 | -0.212 |
| 2006-10-25 | -0.286 | -0.212 |
| 2006-10-26 | -0.287 | -0.215 |
| 2006-10-27 | -0.287 | -0.213 |
| 2006-10-30 | -0.287 | -0.213 |
| 2006-10-31 | -0.289 | -0.215 |
| 2006-11-01 | -0.285 | -0.212 |
| 2006-11-02 | -0.285 | -0.213 |
| 2006-11-03 | -0.288 | -0.214 |
| 2006-11-06 | -0.291 | -0.217 |
| 2006-11-07 | -0.292 | -0.217 |
| 2006-11-08 | -0.294 | -0.218 |
| 2006-11-09 | -0.294 | -0.219 |
| 2006-11-10 | -0.296 | -0.221 |
| 2006-11-13 | -0.296 | -0.223 |
| 2006-11-14 | -0.3 | -0.225 |
| 2006-11-15 | -0.303 | -0.227 |
| 2006-11-16 | -0.299 | -0.225 |
| 2006-11-17 | -0.298 | -0.225 |
| 2006-11-20 | -0.298 | -0.227 |
| 2006-11-21 | -0.3 | -0.229 |
| 2006-11-22 | -0.302 | -0.229 |
| 2006-11-24 | -0.302 | -0.23 |
| 2006-11-27 | -0.295 | -0.225 |
| 2006-11-28 | -0.296 | -0.227 |
| 2006-11-29 | -0.301 | -0.23 |
| 2006-11-30 | -0.303 | -0.231 |
| 2006-12-01 | -0.301 | -0.23 |
| 2006-12-04 | -0.306 | -0.232 |
| 2006-12-05 | -0.306 | -0.233 |
| 2006-12-06 | -0.307 | -0.232 |
| 2006-12-07 | -0.306 | -0.231 |
| 2006-12-08 | -0.305 | -0.231 |
| 2006-12-11 | -0.305 | -0.23 |
| 2006-12-12 | -0.303 | -0.228 |
| 2006-12-13 | -0.304 | -0.229 |
| 2006-12-14 | -0.306 | -0.229 |
| 2006-12-15 | -0.306 | -0.226 |
| 2006-12-18 | -0.3 | -0.22 |
| 2006-12-19 | -0.297 | -0.221 |
| 2006-12-20 | -0.301 | -0.219 |
| 2006-12-21 | -0.301 | -0.218 |
| 2006-12-22 | -0.301 | -0.217 |
| 2006-12-26 | -0.304 | -0.217 |
| 2006-12-27 | -0.309 | -0.219 |
| 2006-12-28 | -0.308 | -0.219 |
| 2006-12-29 | -0.305 | -0.219 |
| 2007-01-03 | -0.306 | -0.212 |
| 2007-01-04 | -0.308 | -0.212 |
| 2007-01-05 | -0.3 | -0.213 |
| 2007-01-08 | -0.301 | -0.213 |
| 2007-01-09 | -0.3 | -0.211 |
| 2007-01-10 | -0.3 | -0.208 |
| 2007-01-11 | -0.303 | -0.209 |
| 2007-01-12 | -0.306 | -0.216 |
| 2007-01-16 | -0.308 | -0.216 |
| 2007-01-17 | -0.305 | -0.215 |
| 2007-01-18 | -0.303 | -0.214 |
| 2007-01-19 | -0.304 | -0.219 |
| 2007-01-22 | -0.3 | -0.218 |
| 2007-01-23 | -0.302 | -0.223 |
| 2007-01-24 | -0.305 | -0.225 |
| 2007-01-25 | -0.304 | -0.222 |
| 2007-01-26 | -0.305 | -0.223 |
| 2007-01-29 | -0.307 | -0.224 |
| 2007-01-30 | -0.307 | -0.228 |
| 2007-01-31 | -0.309 | -0.229 |
| 2007-02-01 | -0.311 | -0.23 |
| 2007-02-02 | -0.312 | -0.231 |
| 2007-02-05 | -0.31 | -0.23 |
| 2007-02-06 | -0.311 | -0.23 |
| 2007-02-07 | -0.313 | -0.233 |
| 2007-02-08 | -0.312 | -0.232 |
| 2007-02-09 | -0.309 | -0.23 |
| 2007-02-12 | -0.309 | -0.226 |
| 2007-02-13 | -0.311 | -0.229 |
| 2007-02-14 | -0.315 | -0.231 |
| 2007-02-15 | -0.318 | -0.231 |
| 2007-02-16 | -0.319 | -0.232 |
| 2007-02-20 | -0.32 | -0.232 |
| 2007-02-21 | -0.32 | -0.233 |
| 2007-02-22 | -0.321 | -0.233 |
| 2007-02-23 | -0.32 | -0.23 |
| 2007-02-26 | -0.319 | -0.226 |
| 2007-02-27 | -0.309 | -0.217 |
| 2007-02-28 | -0.309 | -0.22 |
| 2007-03-01 | -0.307 | -0.216 |
| 2007-03-02 | -0.304 | -0.214 |
| 2007-03-05 | -0.298 | -0.207 |
| 2007-03-06 | -0.305 | -0.213 |
| 2007-03-07 | -0.303 | -0.213 |
| 2007-03-08 | -0.304 | -0.214 |
| 2007-03-09 | -0.305 | -0.215 |
| 2007-03-12 | -0.303 | -0.214 |
| 2007-03-13 | -0.295 | -0.209 |
| 2007-03-14 | -0.298 | -0.211 |
| 2007-03-15 | -0.301 | -0.212 |
| 2007-03-16 | -0.3 | -0.212 |
| 2007-03-19 | -0.302 | -0.21 |
| 2007-03-20 | -0.304 | -0.21 |
| 2007-03-21 | -0.309 | -0.212 |
| 2007-03-22 | -0.309 | -0.213 |
| 2007-03-23 | -0.309 | -0.212 |
| 2007-03-26 | -0.309 | -0.213 |
| 2007-03-27 | -0.306 | -0.211 |
| 2007-03-28 | -0.303 | -0.21 |
| 2007-03-29 | -0.305 | -0.208 |
| 2007-03-30 | -0.306 | -0.211 |
| 2007-04-02 | -0.305 | -0.21 |
| 2007-04-03 | -0.307 | -0.211 |
| 2007-04-04 | -0.307 | -0.211 |
| 2007-04-05 | -0.308 | -0.212 |
| 2007-04-09 | -0.308 | -0.211 |
| 2007-04-10 | -0.31 | -0.211 |
| 2007-04-11 | -0.308 | -0.21 |
| 2007-04-12 | -0.311 | -0.21 |
| 2007-04-13 | -0.315 | -0.213 |
| 2007-04-16 | -0.323 | -0.217 |
| 2007-04-17 | -0.321 | -0.216 |
| 2007-04-18 | -0.32 | -0.216 |
| 2007-04-19 | -0.317 | -0.217 |
| 2007-04-20 | -0.319 | -0.218 |
| 2007-04-23 | -0.316 | -0.216 |
| 2007-04-24 | -0.315 | -0.217 |
| 2007-04-25 | -0.318 | -0.218 |
| 2007-04-26 | -0.321 | -0.22 |
| 2007-04-27 | -0.318 | -0.217 |
| 2007-04-30 | -0.314 | -0.217 |
| 2007-05-01 | -0.316 | -0.218 |
| 2007-05-02 | -0.321 | -0.221 |
| 2007-05-03 | -0.323 | -0.222 |
| 2007-05-04 | -0.324 | -0.225 |
| 2007-05-07 | -0.325 | -0.225 |
| 2007-05-08 | -0.326 | -0.224 |
| 2007-05-09 | -0.326 | -0.223 |
| 2007-05-10 | -0.322 | -0.22 |
| 2007-05-11 | -0.325 | -0.222 |
| 2007-05-14 | -0.323 | -0.222 |
| 2007-05-15 | -0.322 | -0.222 |
| 2007-05-16 | -0.324 | -0.223 |
| 2007-05-17 | -0.324 | -0.225 |
| 2007-05-18 | -0.328 | -0.228 |
| 2007-05-21 | -0.332 | -0.231 |
| 2007-05-22 | -0.331 | -0.231 |
| 2007-05-23 | -0.332 | -0.233 |
| 2007-05-24 | -0.33 | -0.23 |
| 2007-05-25 | -0.331 | -0.23 |
| 2007-05-29 | -0.331 | -0.228 |
| 2007-05-30 | -0.332 | -0.227 |
| 2007-05-31 | -0.333 | -0.23 |
| 2007-06-01 | -0.334 | -0.231 |
| 2007-06-04 | -0.333 | -0.231 |
| 2007-06-05 | -0.331 | -0.23 |
| 2007-06-06 | -0.329 | -0.226 |
| 2007-06-07 | -0.325 | -0.223 |
| 2007-06-08 | -0.328 | -0.226 |
| 2007-06-11 | -0.327 | -0.227 |
| 2007-06-12 | -0.323 | -0.223 |
| 2007-06-13 | -0.324 | -0.226 |
| 2007-06-14 | -0.325 | -0.228 |
| 2007-06-15 | -0.327 | -0.231 |
| 2007-06-18 | -0.327 | -0.231 |
| 2007-06-19 | -0.327 | -0.23 |
| 2007-06-20 | -0.326 | -0.23 |
| 2007-06-21 | -0.329 | -0.233 |
| 2007-06-22 | -0.33 | -0.232 |
| 2007-06-25 | -0.324 | -0.229 |
| 2007-06-26 | -0.322 | -0.227 |
| 2007-06-27 | -0.326 | -0.226 |
| 2007-06-28 | -0.327 | -0.227 |
| 2007-06-29 | -0.327 | -0.228 |
| 2007-07-02 | -0.33 | -0.228 |
| 2007-07-03 | -0.331 | -0.229 |
| 2007-07-05 | -0.332 | -0.229 |
| 2007-07-06 | -0.335 | -0.234 |
| 2007-07-09 | -0.336 | -0.235 |
| 2007-07-10 | -0.331 | -0.231 |
| 2007-07-11 | -0.332 | -0.232 |
| 2007-07-12 | -0.338 | -0.238 |
| 2007-07-13 | -0.339 | -0.237 |
| 2007-07-16 | -0.339 | -0.235 |
| 2007-07-17 | -0.342 | -0.235 |
| 2007-07-18 | -0.34 | -0.234 |
| 2007-07-19 | -0.341 | -0.231 |
| 2007-07-20 | -0.335 | -0.229 |
| 2007-07-23 | -0.334 | -0.227 |
| 2007-07-24 | -0.326 | -0.223 |
| 2007-07-25 | -0.323 | -0.223 |
| 2007-07-26 | -0.317 | -0.218 |
| 2007-07-27 | -0.314 | -0.219 |
| 2007-07-30 | -0.316 | -0.223 |
| 2007-07-31 | -0.313 | -0.22 |
| 2007-08-01 | -0.312 | -0.216 |
| 2007-08-02 | -0.311 | -0.216 |
| 2007-08-03 | -0.301 | -0.213 |
| 2007-08-06 | -0.309 | -0.211 |
| 2007-08-07 | -0.31 | -0.211 |
| 2007-08-08 | -0.315 | -0.22 |
| 2007-08-09 | -0.308 | -0.217 |
| 2007-08-10 | -0.312 | -0.212 |
| 2007-08-13 | -0.31 | -0.211 |
| 2007-08-14 | -0.304 | -0.207 |
| 2007-08-15 | -0.301 | -0.203 |
| 2007-08-16 | -0.302 | -0.214 |
| 2007-08-17 | -0.311 | -0.216 |
| 2007-08-20 | -0.309 | -0.213 |
| 2007-08-21 | -0.311 | -0.215 |
| 2007-08-22 | -0.313 | -0.213 |
| 2007-08-23 | -0.312 | -0.213 |
| 2007-08-24 | -0.313 | -0.211 |
| 2007-08-27 | -0.311 | -0.211 |
| 2007-08-28 | -0.302 | -0.207 |
| 2007-08-29 | -0.308 | -0.208 |
| 2007-08-30 | -0.305 | -0.206 |
| 2007-08-31 | -0.307 | -0.208 |
| 2007-09-04 | -0.312 | -0.207 |
| 2007-09-05 | -0.308 | -0.203 |
| 2007-09-06 | -0.309 | -0.205 |
| 2007-09-07 | -0.304 | -0.204 |
| 2007-09-10 | -0.305 | -0.204 |
| 2007-09-11 | -0.307 | -0.205 |
| 2007-09-12 | -0.307 | -0.205 |
| 2007-09-13 | -0.309 | -0.205 |
| 2007-09-14 | -0.309 | -0.203 |
| 2007-09-17 | -0.307 | -0.203 |
| 2007-09-18 | -0.316 | -0.207 |
| 2007-09-19 | -0.317 | -0.208 |
| 2007-09-20 | -0.314 | -0.205 |
| 2007-09-21 | -0.317 | -0.205 |
| 2007-09-24 | -0.315 | -0.208 |
| 2007-09-25 | -0.314 | -0.208 |
| 2007-09-26 | -0.316 | -0.206 |
| 2007-09-27 | -0.316 | -0.207 |
| 2007-09-28 | -0.317 | -0.208 |
| 2007-10-01 | -0.32 | -0.211 |
| 2007-10-02 | -0.32 | -0.215 |
| 2007-10-03 | -0.319 | -0.215 |
| 2007-10-04 | -0.319 | -0.215 |
| 2007-10-05 | -0.32 | -0.219 |
| 2007-10-08 | -0.318 | -0.222 |
| 2007-10-09 | -0.319 | -0.221 |
| 2007-10-10 | -0.316 | -0.22 |
| 2007-10-11 | -0.32 | -0.215 |
| 2007-10-12 | -0.318 | -0.215 |
| 2007-10-15 | -0.315 | -0.211 |
| 2007-10-16 | -0.314 | -0.21 |
| 2007-10-17 | -0.313 | -0.214 |
| 2007-10-18 | -0.31 | -0.215 |
| 2007-10-19 | -0.304 | -0.212 |
| 2007-10-22 | -0.306 | -0.216 |
| 2007-10-23 | -0.304 | -0.217 |
| 2007-10-24 | -0.299 | -0.21 |
| 2007-10-25 | -0.294 | -0.206 |
| 2007-10-26 | -0.297 | -0.206 |
| 2007-10-29 | -0.294 | -0.208 |
| 2007-10-30 | -0.295 | -0.208 |
| 2007-10-31 | -0.296 | -0.21 |
| 2007-11-01 | -0.288 | -0.208 |
| 2007-11-02 | -0.285 | -0.209 |
| 2007-11-05 | -0.283 | -0.21 |
| 2007-11-06 | -0.283 | -0.213 |
| 2007-11-07 | -0.276 | -0.212 |
| 2007-11-08 | -0.274 | -0.204 |
| 2007-11-09 | -0.274 | -0.204 |
| 2007-11-12 | -0.277 | -0.2 |
| 2007-11-13 | -0.287 | -0.208 |
| 2007-11-14 | -0.285 | -0.206 |
| 2007-11-15 | -0.282 | -0.203 |
| 2007-11-16 | -0.283 | -0.205 |
| 2007-11-19 | -0.277 | -0.205 |
| 2007-11-20 | -0.279 | -0.208 |
| 2007-11-21 | -0.271 | -0.203 |
| 2007-11-23 | -0.278 | -0.204 |
| 2007-11-26 | -0.271 | -0.204 |
| 2007-11-27 | -0.275 | -0.203 |
| 2007-11-28 | -0.283 | -0.206 |
| 2007-11-29 | -0.282 | -0.205 |
| 2007-11-30 | -0.283 | -0.204 |
| 2007-12-03 | -0.28 | -0.205 |
| 2007-12-04 | -0.276 | -0.205 |
| 2007-12-05 | -0.278 | -0.206 |
| 2007-12-06 | -0.285 | -0.206 |
| 2007-12-07 | -0.284 | -0.203 |
| 2007-12-10 | -0.288 | -0.205 |
| 2007-12-11 | -0.279 | -0.204 |
| 2007-12-12 | -0.28 | -0.208 |
| 2007-12-13 | -0.272 | -0.204 |
| 2007-12-14 | -0.269 | -0.205 |
| 2007-12-17 | -0.265 | -0.198 |
| 2007-12-18 | -0.267 | -0.201 |
| 2007-12-19 | -0.271 | -0.205 |
| 2007-12-20 | -0.275 | -0.211 |
| 2007-12-21 | -0.278 | -0.216 |
| 2007-12-24 | -0.28 | -0.216 |
| 2007-12-26 | -0.282 | -0.22 |
| 2007-12-27 | -0.278 | -0.218 |
| 2007-12-28 | -0.28 | -0.221 |
| 2007-12-31 | -0.28 | -0.219 |
| 2008-01-02 | -0.279 | -0.219 |
| 2008-01-03 | -0.277 | -0.215 |
| 2008-01-04 | -0.269 | -0.208 |
| 2008-01-07 | -0.267 | -0.206 |
| 2008-01-08 | -0.264 | -0.201 |
| 2008-01-09 | -0.266 | -0.201 |
| 2008-01-10 | -0.271 | -0.204 |
| 2008-01-11 | -0.272 | -0.2 |
| 2008-01-14 | -0.275 | -0.202 |
| 2008-01-15 | -0.269 | -0.197 |
| 2008-01-16 | -0.278 | -0.189 |
| 2008-01-17 | -0.271 | -0.181 |
| 2008-01-18 | -0.267 | -0.178 |
| 2008-01-22 | -0.274 | -0.169 |
| 2008-01-23 | -0.288 | -0.168 |
| 2008-01-24 | -0.289 | -0.17 |
| 2008-01-25 | -0.287 | -0.173 |
| 2008-01-28 | -0.299 | -0.177 |
| 2008-01-29 | -0.305 | -0.179 |
| 2008-01-30 | -0.301 | -0.177 |
| 2008-01-31 | -0.31 | -0.176 |
| 2008-02-01 | -0.316 | -0.182 |
| 2008-02-04 | -0.313 | -0.178 |
| 2008-02-05 | -0.302 | -0.17 |
| 2008-02-06 | -0.299 | -0.168 |
| 2008-02-07 | -0.298 | -0.168 |
| 2008-02-08 | -0.296 | -0.166 |
| 2008-02-11 | -0.294 | -0.163 |
| 2008-02-12 | -0.296 | -0.163 |
| 2008-02-13 | -0.3 | -0.165 |
| 2008-02-14 | -0.298 | -0.162 |
| 2008-02-15 | -0.298 | -0.161 |
| 2008-02-19 | -0.299 | -0.16 |
| 2008-02-20 | -0.301 | -0.163 |
| 2008-02-21 | -0.295 | -0.161 |
| 2008-02-22 | -0.293 | -0.161 |
| 2008-02-25 | -0.303 | -0.162 |
| 2008-02-26 | -0.306 | -0.162 |
| 2008-02-27 | -0.305 | -0.162 |
| 2008-02-28 | -0.303 | -0.162 |
| 2008-02-29 | -0.296 | -0.157 |
| 2008-03-03 | -0.292 | -0.152 |
| 2008-03-04 | -0.289 | -0.148 |
| 2008-03-05 | -0.288 | -0.15 |
| 2008-03-06 | -0.278 | -0.144 |
| 2008-03-07 | -0.278 | -0.141 |
| 2008-03-10 | -0.272 | -0.134 |
| 2008-03-11 | -0.284 | -0.142 |
| 2008-03-12 | -0.282 | -0.139 |
| 2008-03-13 | -0.287 | -0.141 |
| 2008-03-14 | -0.277 | -0.137 |
| 2008-03-17 | -0.27 | -0.135 |
| 2008-03-18 | -0.283 | -0.151 |
| 2008-03-19 | -0.279 | -0.149 |
| 2008-03-20 | -0.291 | -0.161 |
| 2008-03-24 | -0.298 | -0.157 |
| 2008-03-25 | -0.297 | -0.156 |
| 2008-03-26 | -0.294 | -0.151 |
| 2008-03-27 | -0.29 | -0.148 |
| 2008-03-28 | -0.284 | -0.144 |
| 2008-03-31 | -0.285 | -0.143 |
| 2008-04-01 | -0.301 | -0.155 |
| 2008-04-02 | -0.3 | -0.152 |
| 2008-04-03 | -0.295 | -0.152 |
| 2008-04-04 | -0.289 | -0.15 |
| 2008-04-07 | -0.29 | -0.154 |
| 2008-04-08 | -0.286 | -0.15 |
| 2008-04-09 | -0.276 | -0.15 |
| 2008-04-10 | -0.277 | -0.149 |
| 2008-04-11 | -0.269 | -0.145 |
| 2008-04-14 | -0.259 | -0.142 |
| 2008-04-15 | -0.261 | -0.143 |
| 2008-04-16 | -0.266 | -0.148 |
| 2008-04-17 | -0.266 | -0.151 |
| 2008-04-18 | -0.271 | -0.157 |
| 2008-04-21 | -0.267 | -0.158 |
| 2008-04-22 | -0.265 | -0.156 |
| 2008-04-23 | -0.266 | -0.156 |
| 2008-04-24 | -0.272 | -0.159 |
| 2008-04-25 | -0.275 | -0.162 |
| 2008-04-28 | -0.278 | -0.162 |
| 2008-04-29 | -0.276 | -0.16 |
| 2008-04-30 | -0.275 | -0.16 |
| 2008-05-01 | -0.279 | -0.16 |
| 2008-05-02 | -0.278 | -0.164 |
| 2008-05-05 | -0.276 | -0.166 |
| 2008-05-06 | -0.279 | -0.169 |
| 2008-05-07 | -0.276 | -0.166 |
| 2008-05-08 | -0.275 | -0.168 |
| 2008-05-09 | -0.276 | -0.166 |
| 2008-05-12 | -0.281 | -0.164 |
| 2008-05-13 | -0.281 | -0.162 |
| 2008-05-14 | -0.283 | -0.16 |
| 2008-05-15 | -0.285 | -0.164 |
| 2008-05-16 | -0.282 | -0.168 |
| 2008-05-19 | -0.283 | -0.168 |
| 2008-05-20 | -0.28 | -0.17 |
| 2008-05-21 | -0.277 | -0.169 |
| 2008-05-22 | -0.28 | -0.169 |
| 2008-05-23 | -0.275 | -0.17 |
| 2008-05-27 | -0.278 | -0.171 |
| 2008-05-28 | -0.276 | -0.171 |
| 2008-05-29 | -0.281 | -0.166 |
| 2008-05-30 | -0.28 | -0.171 |
| 2008-06-02 | -0.277 | -0.173 |
| 2008-06-03 | -0.275 | -0.171 |
| 2008-06-04 | -0.276 | -0.17 |
| 2008-06-05 | -0.279 | -0.177 |
| 2008-06-06 | -0.269 | -0.178 |
| 2008-06-09 | -0.264 | -0.179 |
| 2008-06-10 | -0.264 | -0.173 |
| 2008-06-11 | -0.255 | -0.177 |
| 2008-06-12 | -0.259 | -0.175 |
| 2008-06-13 | -0.261 | -0.176 |
| 2008-06-16 | -0.264 | -0.176 |
| 2008-06-17 | -0.258 | -0.182 |
| 2008-06-18 | -0.252 | -0.18 |
| 2008-06-19 | -0.255 | -0.175 |
| 2008-06-20 | -0.249 | -0.173 |
| 2008-06-23 | -0.24 | -0.177 |
| 2008-06-24 | -0.243 | -0.175 |
| 2008-06-25 | -0.246 | -0.176 |
| 2008-06-26 | -0.238 | -0.175 |
| 2008-06-27 | -0.233 | -0.179 |
| 2008-06-30 | -0.227 | -0.179 |
| 2008-07-01 | -0.229 | -0.178 |
| 2008-07-02 | -0.229 | -0.171 |
| 2008-07-03 | -0.231 | -0.171 |
| 2008-07-07 | -0.224 | -0.173 |
| 2008-07-08 | -0.234 | -0.173 |
| 2008-07-09 | -0.224 | -0.175 |
| 2008-07-10 | -0.221 | -0.18 |
| 2008-07-11 | -0.215 | -0.183 |
| 2008-07-14 | -0.206 | -0.186 |
| 2008-07-15 | -0.201 | -0.189 |
| 2008-07-16 | -0.204 | -0.195 |
| 2008-07-17 | -0.202 | -0.199 |
| 2008-07-18 | -0.205 | -0.201 |
| 2008-07-21 | -0.209 | -0.199 |
| 2008-07-22 | -0.207 | -0.204 |
| 2008-07-23 | -0.205 | -0.208 |
| 2008-07-24 | -0.198 | -0.2 |
| 2008-07-25 | -0.199 | -0.202 |
| 2008-07-28 | -0.198 | -0.201 |
| 2008-07-29 | -0.198 | -0.204 |
| 2008-07-30 | -0.202 | -0.2 |
| 2008-07-31 | -0.2 | -0.201 |
| 2008-08-01 | -0.2 | -0.198 |
| 2008-08-04 | -0.197 | -0.188 |
| 2008-08-05 | -0.206 | -0.189 |
| 2008-08-06 | -0.204 | -0.19 |
| 2008-08-07 | -0.196 | -0.187 |
| 2008-08-08 | -0.2 | -0.18 |
| 2008-08-11 | -0.205 | -0.177 |
| 2008-08-12 | -0.198 | -0.174 |
| 2008-08-13 | -0.195 | -0.179 |
| 2008-08-14 | -0.197 | -0.179 |
| 2008-08-15 | -0.2 | -0.178 |
| 2008-08-18 | -0.196 | -0.175 |
| 2008-08-19 | -0.191 | -0.186 |
| 2008-08-20 | -0.19 | -0.198 |
| 2008-08-21 | -0.191 | -0.205 |
| 2008-08-22 | -0.195 | -0.196 |
| 2008-08-25 | -0.19 | -0.194 |
| 2008-08-26 | -0.189 | -0.198 |
| 2008-08-27 | -0.191 | -0.204 |
| 2008-08-28 | -0.195 | -0.202 |
| 2008-08-29 | -0.194 | -0.2 |
| 2008-09-02 | -0.195 | -0.178 |
| 2008-09-03 | -0.197 | -0.169 |
| 2008-09-04 | -0.194 | -0.164 |
| 2008-09-05 | -0.198 | -0.169 |
| 2008-09-08 | -0.204 | -0.157 |
| 2008-09-09 | -0.197 | -0.129 |
| 2008-09-10 | -0.194 | -0.135 |
| 2008-09-11 | -0.195 | -0.135 |
| 2008-09-12 | -0.198 | -0.15 |
| 2008-09-15 | -0.183 | -0.121 |
| 2008-09-16 | -0.184 | -0.13 |
| 2008-09-17 | -0.176 | -0.129 |
| 2008-09-18 | -0.186 | -0.144 |
| 2008-09-19 | -0.199 | -0.175 |
| 2008-09-22 | -0.189 | -0.171 |
| 2008-09-23 | -0.185 | -0.162 |
| 2008-09-24 | -0.186 | -0.159 |
| 2008-09-25 | -0.19 | -0.159 |
| 2008-09-26 | -0.189 | -0.15 |
| 2008-09-29 | -0.166 | -0.123 |
| 2008-09-30 | -0.175 | -0.139 |
| 2008-10-01 | -0.175 | -0.142 |
| 2008-10-02 | -0.166 | -0.138 |
| 2008-10-03 | -0.166 | -0.136 |
| 2008-10-06 | -0.159 | -0.127 |
| 2008-10-07 | -0.151 | -0.114 |
| 2008-10-08 | -0.152 | -0.112 |
| 2008-10-09 | -0.146 | -0.102 |
| 2008-10-10 | -0.137 | -0.1 |
| 2008-10-13 | -0.155 | -0.107 |
| 2008-10-14 | -0.152 | -0.116 |
| 2008-10-15 | -0.136 | -0.102 |
| 2008-10-16 | -0.138 | -0.102 |
| 2008-10-17 | -0.139 | -0.097 |
| 2008-10-20 | -0.145 | -0.104 |
| 2008-10-21 | -0.137 | -0.102 |
| 2008-10-22 | -0.127 | -0.095 |
| 2008-10-23 | -0.123 | -0.103 |
| 2008-10-24 | -0.118 | -0.097 |
| 2008-10-27 | -0.114 | -0.096 |
| 2008-10-28 | -0.127 | -0.105 |
| 2008-10-29 | -0.128 | -0.103 |
| 2008-10-30 | -0.13 | -0.099 |
| 2008-10-31 | -0.13 | -0.096 |
| 2008-11-03 | -0.133 | -0.096 |
| 2008-11-04 | -0.144 | -0.108 |
| 2008-11-05 | -0.135 | -0.097 |
| 2008-11-06 | -0.125 | -0.091 |
| 2008-11-07 | -0.13 | -0.094 |
| 2008-11-10 | -0.128 | -0.093 |
| 2008-11-11 | -0.123 | -0.092 |
| 2008-11-12 | -0.114 | -0.086 |
| 2008-11-13 | -0.121 | -0.088 |
| 2008-11-14 | -0.115 | -0.087 |
| 2008-11-17 | -0.11 | -0.085 |
| 2008-11-18 | -0.109 | -0.088 |
| 2008-11-19 | -0.099 | -0.087 |
| 2008-11-20 | -0.092 | -0.084 |
| 2008-11-21 | -0.098 | -0.084 |
| 2008-11-24 | -0.109 | -0.084 |
| 2008-11-25 | -0.112 | -0.085 |
| 2008-11-26 | -0.118 | -0.082 |
| 2008-11-28 | -0.122 | -0.083 |
| 2008-12-01 | -0.106 | -0.075 |
| 2008-12-02 | -0.112 | -0.078 |
| 2008-12-03 | -0.117 | -0.078 |
| 2008-12-04 | -0.111 | -0.075 |
| 2008-12-05 | -0.117 | -0.079 |
| 2008-12-08 | -0.127 | -0.083 |
| 2008-12-09 | -0.123 | -0.079 |
| 2008-12-10 | -0.127 | -0.076 |
| 2008-12-11 | -0.118 | -0.074 |
| 2008-12-12 | -0.121 | -0.07 |
| 2008-12-15 | -0.117 | -0.068 |
| 2008-12-16 | -0.123 | -0.067 |
| 2008-12-17 | -0.125 | -0.066 |
| 2008-12-18 | -0.12 | -0.065 |
| 2008-12-19 | -0.122 | -0.064 |
| 2008-12-22 | -0.12 | -0.065 |
| 2008-12-23 | -0.119 | -0.063 |
| 2008-12-24 | -0.119 | -0.064 |
| 2008-12-26 | -0.119 | -0.065 |
| 2008-12-29 | -0.118 | -0.067 |
| 2008-12-30 | -0.123 | -0.067 |
| 2008-12-31 | -0.126 | -0.068 |
| 2009-01-02 | -0.13 | -0.067 |
| 2009-01-05 | -0.132 | -0.064 |
| 2009-01-06 | -0.141 | -0.064 |
| 2009-01-07 | -0.137 | -0.061 |
| 2009-01-08 | -0.138 | -0.06 |
| 2009-01-09 | -0.133 | -0.058 |
| 2009-01-12 | -0.13 | -0.058 |
| 2009-01-13 | -0.131 | -0.06 |
| 2009-01-14 | -0.124 | -0.057 |
| 2009-01-15 | -0.123 | -0.051 |
| 2009-01-16 | -0.123 | -0.049 |
| 2009-01-20 | -0.103 | -0.046 |
| 2009-01-21 | -0.114 | -0.05 |
| 2009-01-22 | -0.106 | -0.048 |
| 2009-01-23 | -0.109 | -0.047 |
| 2009-01-26 | -0.109 | -0.047 |
| 2009-01-27 | -0.114 | -0.047 |
| 2009-01-28 | -0.125 | -0.049 |
| 2009-01-29 | -0.112 | -0.05 |
| 2009-01-30 | -0.109 | -0.051 |
| 2009-02-02 | -0.108 | -0.051 |
| 2009-02-03 | -0.108 | -0.051 |
| 2009-02-04 | -0.11 | -0.051 |
| 2009-02-05 | -0.112 | -0.052 |
| 2009-02-06 | -0.118 | -0.054 |
| 2009-02-09 | -0.119 | -0.055 |
| 2009-02-10 | -0.112 | -0.053 |
| 2009-02-11 | -0.115 | -0.053 |
| 2009-02-12 | -0.114 | -0.054 |
| 2009-02-13 | -0.113 | -0.055 |
| 2009-02-17 | -0.104 | -0.051 |
| 2009-02-18 | -0.101 | -0.05 |
| 2009-02-19 | -0.101 | -0.051 |
| 2009-02-20 | -0.098 | -0.048 |
| 2009-02-23 | -0.09 | -0.045 |
| 2009-02-24 | -0.097 | -0.047 |
| 2009-02-25 | -0.091 | -0.045 |
| 2009-02-26 | -0.091 | -0.047 |
| 2009-02-27 | -0.09 | -0.047 |
| 2009-03-02 | -0.082 | -0.041 |
| 2009-03-03 | -0.078 | -0.044 |
| 2009-03-04 | -0.081 | -0.047 |
| 2009-03-05 | -0.073 | -0.043 |
| 2009-03-06 | -0.072 | -0.044 |
| 2009-03-09 | -0.071 | -0.043 |
| 2009-03-10 | -0.08 | -0.051 |
| 2009-03-11 | -0.082 | -0.052 |
| 2009-03-12 | -0.088 | -0.057 |
| 2009-03-13 | -0.09 | -0.06 |
| 2009-03-16 | -0.093 | -0.061 |
| 2009-03-17 | -0.093 | -0.061 |
| 2009-03-18 | -0.097 | -0.06 |
| 2009-03-19 | -0.096 | -0.061 |
| 2009-03-20 | -0.095 | -0.059 |
| 2009-03-23 | -0.099 | -0.063 |
| 2009-03-24 | -0.097 | -0.064 |
| 2009-03-25 | -0.101 | -0.062 |
| 2009-03-26 | -0.103 | -0.065 |
| 2009-03-27 | -0.102 | -0.063 |
| 2009-03-30 | -0.099 | -0.062 |
| 2009-03-31 | -0.102 | -0.061 |
| 2009-04-01 | -0.107 | -0.063 |
| 2009-04-02 | -0.113 | -0.063 |
| 2009-04-03 | -0.113 | -0.061 |
| 2009-04-06 | -0.113 | -0.062 |
| 2009-04-07 | -0.109 | -0.063 |
| 2009-04-08 | -0.11 | -0.064 |
| 2009-04-09 | -0.116 | -0.061 |
| 2009-04-13 | -0.115 | -0.059 |
| 2009-04-14 | -0.116 | -0.062 |
| 2009-04-15 | -0.119 | -0.061 |
| 2009-04-16 | -0.12 | -0.06 |
| 2009-04-17 | -0.12 | -0.061 |
| 2009-04-20 | -0.112 | -0.062 |
| 2009-04-21 | -0.115 | -0.062 |
| 2009-04-22 | -0.114 | -0.059 |
| 2009-04-23 | -0.114 | -0.058 |
| 2009-04-24 | -0.117 | -0.057 |
| 2009-04-27 | -0.116 | -0.059 |
| 2009-04-28 | -0.115 | -0.06 |
| 2009-04-29 | -0.119 | -0.064 |
| 2009-04-30 | -0.122 | -0.065 |
| 2009-05-01 | -0.121 | -0.067 |
| 2009-05-04 | -0.128 | -0.066 |
| 2009-05-05 | -0.127 | -0.065 |
| 2009-05-06 | -0.13 | -0.067 |
| 2009-05-07 | -0.132 | -0.071 |
| 2009-05-08 | -0.141 | -0.075 |
| 2009-05-11 | -0.135 | -0.075 |
| 2009-05-12 | -0.134 | -0.079 |
| 2009-05-13 | -0.13 | -0.081 |
| 2009-05-14 | -0.133 | -0.081 |
| 2009-05-15 | -0.13 | -0.08 |
| 2009-05-18 | -0.135 | -0.075 |
| 2009-05-19 | -0.134 | -0.076 |
| 2009-05-20 | -0.138 | -0.079 |
| 2009-05-21 | -0.135 | -0.08 |
| 2009-05-22 | -0.135 | -0.081 |
| 2009-05-26 | -0.135 | -0.078 |
| 2009-05-27 | -0.133 | -0.081 |
| 2009-05-28 | -0.135 | -0.08 |
| 2009-05-29 | -0.137 | -0.079 |
| 2009-06-01 | -0.142 | -0.076 |
| 2009-06-02 | -0.141 | -0.076 |
| 2009-06-03 | -0.136 | -0.078 |
| 2009-06-04 | -0.137 | -0.075 |
| 2009-06-05 | -0.135 | -0.074 |
| 2009-06-08 | -0.137 | -0.075 |
| 2009-06-09 | -0.139 | -0.074 |
| 2009-06-10 | -0.139 | -0.076 |
| 2009-06-11 | -0.141 | -0.079 |
| 2009-06-12 | -0.141 | -0.079 |
| 2009-06-15 | -0.137 | -0.08 |
| 2009-06-16 | -0.134 | -0.079 |
| 2009-06-17 | -0.134 | -0.077 |
| 2009-06-18 | -0.134 | -0.077 |
| 2009-06-19 | -0.133 | -0.076 |
| 2009-06-22 | -0.128 | -0.072 |
| 2009-06-23 | -0.128 | -0.073 |
| 2009-06-24 | -0.128 | -0.072 |
| 2009-06-25 | -0.133 | -0.074 |
| 2009-06-26 | -0.132 | -0.075 |
| 2009-06-29 | -0.132 | -0.075 |
| 2009-06-30 | -0.132 | -0.075 |
| 2009-07-01 | -0.133 | -0.077 |
| 2009-07-02 | -0.127 | -0.076 |
| 2009-07-06 | -0.126 | -0.078 |
| 2009-07-07 | -0.121 | -0.079 |
| 2009-07-08 | -0.122 | -0.078 |
| 2009-07-09 | -0.121 | -0.076 |
| 2009-07-10 | -0.12 | -0.074 |
| 2009-07-13 | -0.126 | -0.076 |
| 2009-07-14 | -0.127 | -0.075 |
| 2009-07-15 | -0.134 | -0.077 |
| 2009-07-16 | -0.134 | -0.076 |
| 2009-07-17 | -0.131 | -0.076 |
| 2009-07-20 | -0.131 | -0.074 |
| 2009-07-21 | -0.13 | -0.074 |
| 2009-07-22 | -0.131 | -0.077 |
| 2009-07-23 | -0.134 | -0.075 |
| 2009-07-24 | -0.131 | -0.073 |
| 2009-07-27 | -0.132 | -0.074 |
| 2009-07-28 | -0.133 | -0.076 |
| 2009-07-29 | -0.135 | -0.078 |
| 2009-07-30 | -0.134 | -0.078 |
| 2009-07-31 | -0.132 | -0.076 |
| 2009-08-03 | -0.134 | -0.076 |
| 2009-08-04 | -0.135 | -0.074 |
| 2009-08-05 | -0.136 | -0.073 |
| 2009-08-06 | -0.136 | -0.072 |
| 2009-08-07 | -0.137 | -0.07 |
| 2009-08-10 | -0.137 | -0.072 |
| 2009-08-11 | -0.136 | -0.074 |
| 2009-08-12 | -0.136 | -0.074 |
| 2009-08-13 | -0.138 | -0.075 |
| 2009-08-14 | -0.139 | -0.076 |
| 2009-08-17 | -0.139 | -0.076 |
| 2009-08-18 | -0.139 | -0.076 |
| 2009-08-19 | -0.14 | -0.077 |
| 2009-08-20 | -0.14 | -0.077 |
| 2009-08-21 | -0.143 | -0.079 |
| 2009-08-24 | -0.145 | -0.081 |
| 2009-08-25 | -0.145 | -0.081 |
| 2009-08-26 | -0.146 | -0.081 |
| 2009-08-27 | -0.146 | -0.082 |
| 2009-08-28 | -0.146 | -0.081 |
| 2009-08-31 | -0.146 | -0.082 |
| 2009-09-01 | -0.147 | -0.082 |
| 2009-09-02 | -0.147 | -0.082 |
| 2009-09-03 | -0.146 | -0.082 |
| 2009-09-04 | -0.146 | -0.082 |
| 2009-09-08 | -0.146 | -0.082 |
| 2009-09-09 | -0.145 | -0.081 |
| 2009-09-10 | -0.145 | -0.08 |
| 2009-09-11 | -0.146 | -0.082 |
| 2009-09-14 | -0.147 | -0.081 |
| 2009-09-15 | -0.147 | -0.08 |
| 2009-09-16 | -0.149 | -0.082 |
| 2009-09-17 | -0.148 | -0.083 |
| 2009-09-18 | -0.148 | -0.083 |
| 2009-09-21 | -0.146 | -0.081 |
| 2009-09-22 | -0.148 | -0.083 |
| 2009-09-23 | -0.147 | -0.082 |
| 2009-09-24 | -0.147 | -0.08 |
| 2009-09-25 | -0.147 | -0.082 |
| 2009-09-28 | -0.148 | -0.083 |
| 2009-09-29 | -0.148 | -0.081 |
| 2009-09-30 | -0.148 | -0.082 |
| 2009-10-01 | -0.147 | -0.083 |
| 2009-10-02 | -0.145 | -0.081 |
| 2009-10-05 | -0.148 | -0.08 |
| 2009-10-06 | -0.147 | -0.08 |
| 2009-10-07 | -0.147 | -0.079 |
| 2009-10-08 | -0.147 | -0.078 |
| 2009-10-09 | -0.148 | -0.079 |
| 2009-10-12 | -0.149 | -0.079 |
| 2009-10-13 | -0.148 | -0.079 |
| 2009-10-14 | -0.15 | -0.078 |
| 2009-10-15 | -0.151 | -0.078 |
| 2009-10-16 | -0.149 | -0.078 |
| 2009-10-19 | -0.149 | -0.079 |
| 2009-10-20 | -0.148 | -0.078 |
| 2009-10-21 | -0.145 | -0.077 |
| 2009-10-22 | -0.149 | -0.078 |
| 2009-10-23 | -0.149 | -0.078 |
| 2009-10-26 | -0.146 | -0.077 |
| 2009-10-27 | -0.149 | -0.079 |
| 2009-10-28 | -0.149 | -0.08 |
| 2009-10-29 | -0.152 | -0.082 |
| 2009-10-30 | -0.149 | -0.08 |
| 2009-11-02 | -0.149 | -0.081 |
| 2009-11-03 | -0.144 | -0.079 |
| 2009-11-04 | -0.144 | -0.079 |
| 2009-11-05 | -0.146 | -0.078 |
| 2009-11-06 | -0.147 | -0.08 |
| 2009-11-09 | -0.148 | -0.079 |
| 2009-11-10 | -0.148 | -0.079 |
| 2009-11-11 | -0.148 | -0.078 |
| 2009-11-12 | -0.149 | -0.08 |
| 2009-11-13 | -0.149 | -0.079 |
| 2009-11-16 | -0.15 | -0.075 |
| 2009-11-17 | -0.149 | -0.074 |
| 2009-11-18 | -0.149 | -0.077 |
| 2009-11-19 | -0.15 | -0.081 |
| 2009-11-20 | -0.152 | -0.082 |
| 2009-11-23 | -0.154 | -0.083 |
| 2009-11-24 | -0.155 | -0.085 |
| 2009-11-25 | -0.154 | -0.086 |
| 2009-11-27 | -0.153 | -0.086 |
| 2009-11-30 | -0.154 | -0.086 |
| 2009-12-01 | -0.156 | -0.086 |
| 2009-12-02 | -0.156 | -0.082 |
| 2009-12-03 | -0.156 | -0.082 |
| 2009-12-04 | -0.158 | -0.077 |
| 2009-12-07 | -0.159 | -0.077 |
| 2009-12-08 | -0.161 | -0.077 |
| 2009-12-09 | -0.161 | -0.077 |
| 2009-12-10 | -0.16 | -0.079 |
| 2009-12-11 | -0.161 | -0.074 |
| 2009-12-14 | -0.161 | -0.074 |
| 2009-12-15 | -0.159 | -0.074 |
| 2009-12-16 | -0.157 | -0.073 |
| 2009-12-17 | -0.156 | -0.072 |
| 2009-12-18 | -0.159 | -0.069 |
| 2009-12-21 | -0.157 | -0.069 |
| 2009-12-22 | -0.157 | -0.068 |
| 2009-12-23 | -0.157 | -0.068 |
| 2009-12-24 | -0.157 | -0.067 |
| 2009-12-28 | -0.159 | -0.069 |
| 2009-12-29 | -0.16 | -0.07 |
| 2009-12-30 | -0.161 | -0.07 |
| 2009-12-31 | -0.16 | -0.071 |
| 2010-01-04 | -0.161 | -0.068 |
| 2010-01-05 | -0.16 | -0.068 |
| 2010-01-06 | -0.16 | -0.068 |
| 2010-01-07 | -0.159 | -0.068 |
| 2010-01-08 | -0.159 | -0.066 |
| 2010-01-11 | -0.162 | -0.067 |
| 2010-01-12 | -0.163 | -0.069 |
| 2010-01-13 | -0.163 | -0.068 |
| 2010-01-14 | -0.163 | -0.067 |
| 2010-01-15 | -0.163 | -0.068 |
| 2010-01-19 | -0.167 | -0.066 |
| 2010-01-20 | -0.164 | -0.065 |
| 2010-01-21 | -0.162 | -0.062 |
| 2010-01-22 | -0.166 | -0.067 |
| 2010-01-25 | -0.164 | -0.067 |
| 2010-01-26 | -0.163 | -0.066 |
| 2010-01-27 | -0.163 | -0.063 |
| 2010-01-28 | -0.161 | -0.064 |
| 2010-01-29 | -0.161 | -0.066 |
| 2010-02-01 | -0.161 | -0.065 |
| 2010-02-02 | -0.164 | -0.064 |
| 2010-02-03 | -0.164 | -0.062 |
| 2010-02-04 | -0.164 | -0.064 |
| 2010-02-05 | -0.163 | -0.066 |
| 2010-02-08 | -0.163 | -0.061 |
| 2010-02-09 | -0.165 | -0.06 |
| 2010-02-10 | -0.163 | -0.06 |
| 2010-02-11 | -0.167 | -0.059 |
| 2010-02-12 | -0.17 | -0.059 |
| 2010-02-16 | -0.172 | -0.058 |
| 2010-02-17 | -0.174 | -0.058 |
| 2010-02-18 | -0.177 | -0.058 |
| 2010-02-19 | -0.178 | -0.059 |
| 2010-02-22 | -0.178 | -0.06 |
| 2010-02-23 | -0.177 | -0.063 |
| 2010-02-24 | -0.178 | -0.062 |
| 2010-02-25 | -0.178 | -0.06 |
| 2010-02-26 | -0.177 | -0.057 |
| 2010-03-01 | -0.178 | -0.057 |
| 2010-03-02 | -0.181 | -0.059 |
| 2010-03-03 | -0.181 | -0.059 |
| 2010-03-04 | -0.182 | -0.06 |
| 2010-03-05 | -0.186 | -0.061 |
| 2010-03-08 | -0.186 | -0.061 |
| 2010-03-09 | -0.187 | -0.06 |
| 2010-03-10 | -0.187 | -0.06 |
| 2010-03-11 | -0.187 | -0.06 |
| 2010-03-12 | -0.189 | -0.06 |
| 2010-03-15 | -0.187 | -0.06 |
| 2010-03-16 | -0.187 | -0.06 |
| 2010-03-17 | -0.188 | -0.06 |
| 2010-03-18 | -0.187 | -0.059 |
| 2010-03-19 | -0.184 | -0.059 |
| 2010-03-22 | -0.182 | -0.055 |
| 2010-03-23 | -0.182 | -0.055 |
| 2010-03-24 | -0.183 | -0.053 |
| 2010-03-25 | -0.181 | -0.05 |
| 2010-03-26 | -0.18 | -0.05 |
| 2010-03-29 | -0.183 | -0.053 |
| 2010-03-30 | -0.184 | -0.053 |
| 2010-03-31 | -0.186 | -0.056 |
| 2010-04-01 | -0.19 | -0.059 |
| 2010-04-05 | -0.194 | -0.06 |
| 2010-04-06 | -0.195 | -0.059 |
| 2010-04-07 | -0.194 | -0.06 |
| 2010-04-08 | -0.196 | -0.059 |
| 2010-04-09 | -0.197 | -0.058 |
| 2010-04-12 | -0.197 | -0.059 |
| 2010-04-13 | -0.197 | -0.056 |
| 2010-04-14 | -0.2 | -0.059 |
| 2010-04-15 | -0.2 | -0.06 |
| 2010-04-16 | -0.197 | -0.059 |
| 2010-04-19 | -0.197 | -0.06 |
| 2010-04-20 | -0.202 | -0.063 |
| 2010-04-21 | -0.203 | -0.062 |
| 2010-04-22 | -0.204 | -0.065 |
| 2010-04-23 | -0.209 | -0.069 |
| 2010-04-26 | -0.209 | -0.065 |
| 2010-04-27 | -0.204 | -0.064 |
| 2010-04-28 | -0.206 | -0.065 |
| 2010-04-29 | -0.206 | -0.062 |
| 2010-04-30 | -0.203 | -0.06 |
| 2010-05-03 | -0.204 | -0.058 |
| 2010-05-04 | -0.198 | -0.057 |
| 2010-05-05 | -0.198 | -0.057 |
| 2010-05-06 | -0.195 | -0.054 |
| 2010-05-07 | -0.192 | -0.049 |
| 2010-05-10 | -0.201 | -0.054 |
| 2010-05-11 | -0.2 | -0.054 |
| 2010-05-12 | -0.203 | -0.056 |
| 2010-05-13 | -0.203 | -0.056 |
| 2010-05-14 | -0.2 | -0.053 |
| 2010-05-17 | -0.203 | -0.052 |
| 2010-05-18 | -0.201 | -0.051 |
| 2010-05-19 | -0.2 | -0.052 |
| 2010-05-20 | -0.193 | -0.049 |
| 2010-05-21 | -0.192 | -0.05 |
| 2010-05-24 | -0.188 | -0.047 |
| 2010-05-25 | -0.186 | -0.046 |
| 2010-05-26 | -0.185 | -0.045 |
| 2010-05-27 | -0.19 | -0.047 |
| 2010-05-28 | -0.187 | -0.045 |
| 2010-06-01 | -0.18 | -0.039 |
| 2010-06-02 | -0.184 | -0.043 |
| 2010-06-03 | -0.185 | -0.042 |
| 2010-06-04 | -0.179 | -0.041 |
| 2010-06-07 | -0.178 | -0.042 |
| 2010-06-08 | -0.179 | -0.045 |
| 2010-06-09 | -0.178 | -0.043 |
| 2010-06-10 | -0.183 | -0.047 |
| 2010-06-11 | -0.183 | -0.047 |
| 2010-06-14 | -0.184 | -0.043 |
| 2010-06-15 | -0.187 | -0.048 |
| 2010-06-16 | -0.186 | -0.05 |
| 2010-06-17 | -0.186 | -0.051 |
| 2010-06-18 | -0.188 | -0.052 |
| 2010-06-21 | -0.188 | -0.056 |
| 2010-06-22 | -0.186 | -0.054 |
| 2010-06-23 | -0.185 | -0.051 |
| 2010-06-24 | -0.184 | -0.05 |
| 2010-06-25 | -0.186 | -0.051 |
| 2010-06-28 | -0.186 | -0.05 |
| 2010-06-29 | -0.183 | -0.049 |
| 2010-06-30 | -0.182 | -0.048 |
| 2010-07-01 | -0.182 | -0.048 |
| 2010-07-02 | -0.182 | -0.049 |
| 2010-07-06 | -0.18 | -0.056 |
| 2010-07-07 | -0.183 | -0.063 |
| 2010-07-08 | -0.187 | -0.064 |
| 2010-07-09 | -0.188 | -0.064 |
| 2010-07-12 | -0.186 | -0.068 |
| 2010-07-13 | -0.192 | -0.065 |
| 2010-07-14 | -0.19 | -0.063 |
| 2010-07-15 | -0.189 | -0.066 |
| 2010-07-16 | -0.183 | -0.067 |
| 2010-07-19 | -0.186 | -0.066 |
| 2010-07-20 | -0.188 | -0.067 |
| 2010-07-21 | -0.187 | -0.066 |
| 2010-07-22 | -0.193 | -0.065 |
| 2010-07-23 | -0.194 | -0.06 |
| 2010-07-26 | -0.198 | -0.058 |
| 2010-07-27 | -0.198 | -0.06 |
| 2010-07-28 | -0.197 | -0.063 |
| 2010-07-29 | -0.197 | -0.062 |
| 2010-07-30 | -0.198 | -0.059 |
| 2010-08-02 | -0.201 | -0.06 |
| 2010-08-03 | -0.2 | -0.063 |
| 2010-08-04 | -0.2 | -0.06 |
| 2010-08-05 | -0.198 | -0.062 |
| 2010-08-06 | -0.194 | -0.062 |
| 2010-08-09 | -0.198 | -0.061 |
| 2010-08-10 | -0.196 | -0.066 |
| 2010-08-11 | -0.19 | -0.068 |
| 2010-08-12 | -0.189 | -0.07 |
| 2010-08-13 | -0.187 | -0.071 |
| 2010-08-16 | -0.187 | -0.071 |
| 2010-08-17 | -0.189 | -0.071 |
| 2010-08-18 | -0.188 | -0.069 |
| 2010-08-19 | -0.185 | -0.069 |
| 2010-08-20 | -0.183 | -0.066 |
| 2010-08-23 | -0.182 | -0.068 |
| 2010-08-24 | -0.179 | -0.068 |
| 2010-08-25 | -0.18 | -0.067 |
| 2010-08-26 | -0.179 | -0.067 |
| 2010-08-27 | -0.182 | -0.068 |
| 2010-08-30 | -0.181 | -0.068 |
| 2010-08-31 | -0.178 | -0.068 |
| 2010-09-01 | -0.181 | -0.067 |
| 2010-09-02 | -0.181 | -0.067 |
| 2010-09-03 | -0.182 | -0.066 |
| 2010-09-07 | -0.18 | -0.067 |
| 2010-09-08 | -0.18 | -0.067 |
| 2010-09-09 | -0.181 | -0.069 |
| 2010-09-10 | -0.18 | -0.07 |
| 2010-09-13 | -0.181 | -0.067 |
| 2010-09-14 | -0.184 | -0.068 |
| 2010-09-15 | -0.184 | -0.068 |
| 2010-09-16 | -0.182 | -0.068 |
| 2010-09-17 | -0.184 | -0.067 |
| 2010-09-20 | -0.184 | -0.066 |
| 2010-09-21 | -0.185 | -0.066 |
| 2010-09-22 | -0.183 | -0.065 |
| 2010-09-23 | -0.184 | -0.065 |
| 2010-09-24 | -0.187 | -0.063 |
| 2010-09-27 | -0.184 | -0.062 |
| 2010-09-28 | -0.187 | -0.063 |
| 2010-09-29 | -0.187 | -0.063 |
| 2010-09-30 | -0.189 | -0.063 |
| 2010-10-01 | -0.189 | -0.063 |
| 2010-10-04 | -0.187 | -0.063 |
| 2010-10-05 | -0.192 | -0.062 |
| 2010-10-06 | -0.194 | -0.061 |
| 2010-10-07 | -0.194 | -0.061 |
| 2010-10-08 | -0.196 | -0.06 |
| 2010-10-11 | -0.195 | -0.059 |
| 2010-10-12 | -0.195 | -0.058 |
| 2010-10-13 | -0.197 | -0.057 |
| 2010-10-14 | -0.194 | -0.057 |
| 2010-10-15 | -0.194 | -0.058 |
| 2010-10-18 | -0.195 | -0.056 |
| 2010-10-19 | -0.192 | -0.056 |
| 2010-10-20 | -0.193 | -0.056 |
| 2010-10-21 | -0.191 | -0.056 |
| 2010-10-22 | -0.191 | -0.057 |
| 2010-10-25 | -0.192 | -0.058 |
| 2010-10-26 | -0.191 | -0.054 |
| 2010-10-27 | -0.188 | -0.054 |
| 2010-10-28 | -0.191 | -0.056 |
| 2010-10-29 | -0.192 | -0.055 |
| 2010-11-01 | -0.192 | -0.055 |
| 2010-11-02 | -0.195 | -0.055 |
| 2010-11-03 | -0.194 | -0.052 |
| 2010-11-04 | -0.195 | -0.051 |
| 2010-11-05 | -0.195 | -0.05 |
| 2010-11-08 | -0.194 | -0.049 |
| 2010-11-09 | -0.194 | -0.051 |
| 2010-11-10 | -0.196 | -0.051 |
| 2010-11-11 | -0.196 | -0.052 |
| 2010-11-12 | -0.196 | -0.053 |
| 2010-11-15 | -0.196 | -0.051 |
| 2010-11-16 | -0.195 | -0.05 |
| 2010-11-17 | -0.196 | -0.05 |
| 2010-11-18 | -0.195 | -0.05 |
| 2010-11-19 | -0.195 | -0.05 |
| 2010-11-22 | -0.196 | -0.05 |
| 2010-11-23 | -0.196 | -0.049 |
| 2010-11-24 | -0.198 | -0.051 |
| 2010-11-26 | -0.197 | -0.051 |
| 2010-11-29 | -0.197 | -0.05 |
| 2010-11-30 | -0.197 | -0.05 |
| 2010-12-01 | -0.2 | -0.05 |
| 2010-12-02 | -0.2 | -0.048 |
| 2010-12-03 | -0.202 | -0.047 |
| 2010-12-06 | -0.202 | -0.048 |
| 2010-12-07 | -0.205 | -0.05 |
| 2010-12-08 | -0.202 | -0.048 |
| 2010-12-09 | -0.2 | -0.044 |
| 2010-12-10 | -0.202 | -0.045 |
| 2010-12-13 | -0.204 | -0.044 |
| 2010-12-14 | -0.206 | -0.049 |
| 2010-12-15 | -0.207 | -0.052 |
| 2010-12-16 | -0.206 | -0.053 |
| 2010-12-17 | -0.204 | -0.054 |
| 2010-12-20 | -0.205 | -0.054 |
| 2010-12-21 | -0.205 | -0.055 |
| 2010-12-22 | -0.207 | -0.054 |
| 2010-12-23 | -0.208 | -0.052 |
| 2010-12-27 | -0.209 | -0.051 |
| 2010-12-28 | -0.211 | -0.051 |
| 2010-12-29 | -0.212 | -0.051 |
| 2010-12-30 | -0.213 | -0.052 |
| 2010-12-31 | -0.213 | -0.049 |
| 2011-01-03 | -0.213 | -0.05 |
| 2011-01-04 | -0.21 | -0.051 |
| 2011-01-05 | -0.206 | -0.052 |
| 2011-01-06 | -0.203 | -0.052 |
| 2011-01-07 | -0.202 | -0.051 |
| 2011-01-10 | -0.203 | -0.052 |
| 2011-01-11 | -0.204 | -0.053 |
| 2011-01-12 | -0.205 | -0.055 |
| 2011-01-13 | -0.204 | -0.056 |
| 2011-01-14 | -0.203 | -0.057 |
| 2011-01-18 | -0.207 | -0.057 |
| 2011-01-19 | -0.211 | -0.058 |
| 2011-01-20 | -0.211 | -0.056 |
| 2011-01-21 | -0.211 | -0.057 |
| 2011-01-24 | -0.211 | -0.056 |
| 2011-01-25 | -0.212 | -0.055 |
| 2011-01-26 | -0.212 | -0.056 |
| 2011-01-27 | -0.212 | -0.056 |
| 2011-01-28 | -0.215 | -0.057 |
| 2011-01-31 | -0.214 | -0.061 |